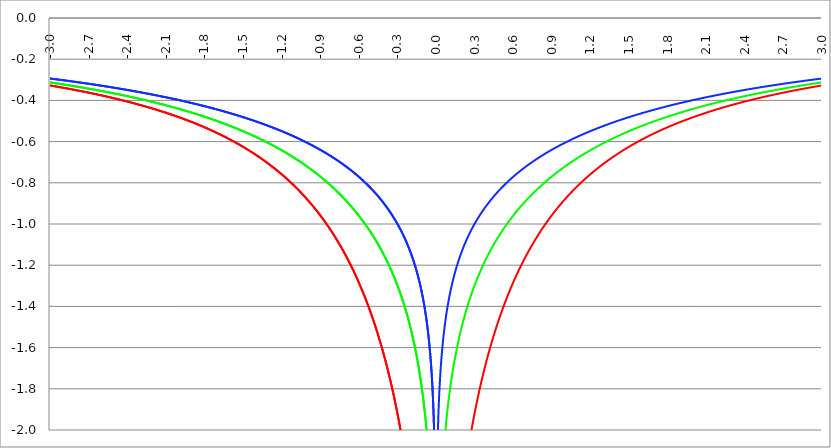
| Category | Series 1 | Series 0 | Series 2 |
|---|---|---|---|
| -3.0 | -0.327 | -0.313 | -0.294 |
| -2.997 | -0.328 | -0.313 | -0.294 |
| -2.994 | -0.328 | -0.313 | -0.294 |
| -2.991 | -0.328 | -0.313 | -0.294 |
| -2.988 | -0.329 | -0.314 | -0.295 |
| -2.984999999999999 | -0.329 | -0.314 | -0.295 |
| -2.981999999999999 | -0.329 | -0.314 | -0.295 |
| -2.978999999999999 | -0.33 | -0.315 | -0.295 |
| -2.975999999999999 | -0.33 | -0.315 | -0.296 |
| -2.972999999999999 | -0.33 | -0.315 | -0.296 |
| -2.969999999999999 | -0.331 | -0.315 | -0.296 |
| -2.966999999999999 | -0.331 | -0.316 | -0.296 |
| -2.963999999999999 | -0.331 | -0.316 | -0.297 |
| -2.960999999999998 | -0.332 | -0.316 | -0.297 |
| -2.957999999999998 | -0.332 | -0.317 | -0.297 |
| -2.954999999999998 | -0.332 | -0.317 | -0.297 |
| -2.951999999999998 | -0.333 | -0.317 | -0.298 |
| -2.948999999999998 | -0.333 | -0.317 | -0.298 |
| -2.945999999999998 | -0.333 | -0.318 | -0.298 |
| -2.942999999999998 | -0.334 | -0.318 | -0.298 |
| -2.939999999999998 | -0.334 | -0.318 | -0.299 |
| -2.936999999999998 | -0.334 | -0.319 | -0.299 |
| -2.933999999999997 | -0.335 | -0.319 | -0.299 |
| -2.930999999999997 | -0.335 | -0.319 | -0.299 |
| -2.927999999999997 | -0.335 | -0.319 | -0.3 |
| -2.924999999999997 | -0.336 | -0.32 | -0.3 |
| -2.921999999999997 | -0.336 | -0.32 | -0.3 |
| -2.918999999999997 | -0.336 | -0.32 | -0.3 |
| -2.915999999999997 | -0.337 | -0.321 | -0.301 |
| -2.912999999999997 | -0.337 | -0.321 | -0.301 |
| -2.909999999999997 | -0.337 | -0.321 | -0.301 |
| -2.906999999999996 | -0.338 | -0.321 | -0.301 |
| -2.903999999999996 | -0.338 | -0.322 | -0.302 |
| -2.900999999999996 | -0.338 | -0.322 | -0.302 |
| -2.897999999999996 | -0.339 | -0.322 | -0.302 |
| -2.894999999999996 | -0.339 | -0.323 | -0.302 |
| -2.891999999999996 | -0.339 | -0.323 | -0.303 |
| -2.888999999999996 | -0.34 | -0.323 | -0.303 |
| -2.885999999999996 | -0.34 | -0.323 | -0.303 |
| -2.882999999999996 | -0.34 | -0.324 | -0.303 |
| -2.879999999999995 | -0.341 | -0.324 | -0.304 |
| -2.876999999999995 | -0.341 | -0.324 | -0.304 |
| -2.873999999999995 | -0.341 | -0.325 | -0.304 |
| -2.870999999999995 | -0.342 | -0.325 | -0.304 |
| -2.867999999999995 | -0.342 | -0.325 | -0.305 |
| -2.864999999999995 | -0.342 | -0.326 | -0.305 |
| -2.861999999999995 | -0.343 | -0.326 | -0.305 |
| -2.858999999999995 | -0.343 | -0.326 | -0.305 |
| -2.855999999999994 | -0.343 | -0.326 | -0.306 |
| -2.852999999999994 | -0.344 | -0.327 | -0.306 |
| -2.849999999999994 | -0.344 | -0.327 | -0.306 |
| -2.846999999999994 | -0.344 | -0.327 | -0.306 |
| -2.843999999999994 | -0.345 | -0.328 | -0.307 |
| -2.840999999999994 | -0.345 | -0.328 | -0.307 |
| -2.837999999999994 | -0.345 | -0.328 | -0.307 |
| -2.834999999999994 | -0.346 | -0.329 | -0.307 |
| -2.831999999999994 | -0.346 | -0.329 | -0.308 |
| -2.828999999999993 | -0.347 | -0.329 | -0.308 |
| -2.825999999999993 | -0.347 | -0.329 | -0.308 |
| -2.822999999999993 | -0.347 | -0.33 | -0.308 |
| -2.819999999999993 | -0.348 | -0.33 | -0.309 |
| -2.816999999999993 | -0.348 | -0.33 | -0.309 |
| -2.813999999999993 | -0.348 | -0.331 | -0.309 |
| -2.810999999999993 | -0.349 | -0.331 | -0.309 |
| -2.807999999999993 | -0.349 | -0.331 | -0.31 |
| -2.804999999999993 | -0.349 | -0.332 | -0.31 |
| -2.801999999999992 | -0.35 | -0.332 | -0.31 |
| -2.798999999999992 | -0.35 | -0.332 | -0.31 |
| -2.795999999999992 | -0.35 | -0.333 | -0.311 |
| -2.792999999999992 | -0.351 | -0.333 | -0.311 |
| -2.789999999999992 | -0.351 | -0.333 | -0.311 |
| -2.786999999999992 | -0.352 | -0.334 | -0.311 |
| -2.783999999999992 | -0.352 | -0.334 | -0.312 |
| -2.780999999999992 | -0.352 | -0.334 | -0.312 |
| -2.777999999999992 | -0.353 | -0.334 | -0.312 |
| -2.774999999999991 | -0.353 | -0.335 | -0.313 |
| -2.771999999999991 | -0.353 | -0.335 | -0.313 |
| -2.768999999999991 | -0.354 | -0.335 | -0.313 |
| -2.765999999999991 | -0.354 | -0.336 | -0.313 |
| -2.762999999999991 | -0.354 | -0.336 | -0.314 |
| -2.759999999999991 | -0.355 | -0.336 | -0.314 |
| -2.756999999999991 | -0.355 | -0.337 | -0.314 |
| -2.753999999999991 | -0.356 | -0.337 | -0.314 |
| -2.75099999999999 | -0.356 | -0.337 | -0.315 |
| -2.74799999999999 | -0.356 | -0.338 | -0.315 |
| -2.74499999999999 | -0.357 | -0.338 | -0.315 |
| -2.74199999999999 | -0.357 | -0.338 | -0.315 |
| -2.73899999999999 | -0.357 | -0.339 | -0.316 |
| -2.73599999999999 | -0.358 | -0.339 | -0.316 |
| -2.73299999999999 | -0.358 | -0.339 | -0.316 |
| -2.72999999999999 | -0.359 | -0.34 | -0.317 |
| -2.72699999999999 | -0.359 | -0.34 | -0.317 |
| -2.723999999999989 | -0.359 | -0.34 | -0.317 |
| -2.720999999999989 | -0.36 | -0.341 | -0.317 |
| -2.717999999999989 | -0.36 | -0.341 | -0.318 |
| -2.714999999999989 | -0.36 | -0.341 | -0.318 |
| -2.711999999999989 | -0.361 | -0.342 | -0.318 |
| -2.708999999999989 | -0.361 | -0.342 | -0.318 |
| -2.705999999999989 | -0.362 | -0.342 | -0.319 |
| -2.702999999999989 | -0.362 | -0.343 | -0.319 |
| -2.699999999999989 | -0.362 | -0.343 | -0.319 |
| -2.696999999999988 | -0.363 | -0.343 | -0.32 |
| -2.693999999999988 | -0.363 | -0.344 | -0.32 |
| -2.690999999999988 | -0.364 | -0.344 | -0.32 |
| -2.687999999999988 | -0.364 | -0.344 | -0.32 |
| -2.684999999999988 | -0.364 | -0.345 | -0.321 |
| -2.681999999999988 | -0.365 | -0.345 | -0.321 |
| -2.678999999999988 | -0.365 | -0.345 | -0.321 |
| -2.675999999999988 | -0.365 | -0.346 | -0.321 |
| -2.672999999999988 | -0.366 | -0.346 | -0.322 |
| -2.669999999999987 | -0.366 | -0.346 | -0.322 |
| -2.666999999999987 | -0.367 | -0.347 | -0.322 |
| -2.663999999999987 | -0.367 | -0.347 | -0.323 |
| -2.660999999999987 | -0.367 | -0.347 | -0.323 |
| -2.657999999999987 | -0.368 | -0.348 | -0.323 |
| -2.654999999999987 | -0.368 | -0.348 | -0.323 |
| -2.651999999999987 | -0.369 | -0.348 | -0.324 |
| -2.648999999999987 | -0.369 | -0.349 | -0.324 |
| -2.645999999999986 | -0.369 | -0.349 | -0.324 |
| -2.642999999999986 | -0.37 | -0.349 | -0.325 |
| -2.639999999999986 | -0.37 | -0.35 | -0.325 |
| -2.636999999999986 | -0.371 | -0.35 | -0.325 |
| -2.633999999999986 | -0.371 | -0.35 | -0.325 |
| -2.630999999999986 | -0.371 | -0.351 | -0.326 |
| -2.627999999999986 | -0.372 | -0.351 | -0.326 |
| -2.624999999999986 | -0.372 | -0.351 | -0.326 |
| -2.621999999999986 | -0.373 | -0.352 | -0.327 |
| -2.618999999999985 | -0.373 | -0.352 | -0.327 |
| -2.615999999999985 | -0.374 | -0.352 | -0.327 |
| -2.612999999999985 | -0.374 | -0.353 | -0.327 |
| -2.609999999999985 | -0.374 | -0.353 | -0.328 |
| -2.606999999999985 | -0.375 | -0.353 | -0.328 |
| -2.603999999999985 | -0.375 | -0.354 | -0.328 |
| -2.600999999999985 | -0.376 | -0.354 | -0.329 |
| -2.597999999999985 | -0.376 | -0.354 | -0.329 |
| -2.594999999999985 | -0.376 | -0.355 | -0.329 |
| -2.591999999999985 | -0.377 | -0.355 | -0.329 |
| -2.588999999999984 | -0.377 | -0.356 | -0.33 |
| -2.585999999999984 | -0.378 | -0.356 | -0.33 |
| -2.582999999999984 | -0.378 | -0.356 | -0.33 |
| -2.579999999999984 | -0.378 | -0.357 | -0.331 |
| -2.576999999999984 | -0.379 | -0.357 | -0.331 |
| -2.573999999999984 | -0.379 | -0.357 | -0.331 |
| -2.570999999999984 | -0.38 | -0.358 | -0.332 |
| -2.567999999999984 | -0.38 | -0.358 | -0.332 |
| -2.564999999999984 | -0.381 | -0.358 | -0.332 |
| -2.561999999999983 | -0.381 | -0.359 | -0.332 |
| -2.558999999999983 | -0.381 | -0.359 | -0.333 |
| -2.555999999999983 | -0.382 | -0.359 | -0.333 |
| -2.552999999999983 | -0.382 | -0.36 | -0.333 |
| -2.549999999999983 | -0.383 | -0.36 | -0.334 |
| -2.546999999999983 | -0.383 | -0.361 | -0.334 |
| -2.543999999999983 | -0.384 | -0.361 | -0.334 |
| -2.540999999999983 | -0.384 | -0.361 | -0.335 |
| -2.537999999999982 | -0.384 | -0.362 | -0.335 |
| -2.534999999999982 | -0.385 | -0.362 | -0.335 |
| -2.531999999999982 | -0.385 | -0.362 | -0.335 |
| -2.528999999999982 | -0.386 | -0.363 | -0.336 |
| -2.525999999999982 | -0.386 | -0.363 | -0.336 |
| -2.522999999999982 | -0.387 | -0.363 | -0.336 |
| -2.519999999999982 | -0.387 | -0.364 | -0.337 |
| -2.516999999999982 | -0.388 | -0.364 | -0.337 |
| -2.513999999999982 | -0.388 | -0.365 | -0.337 |
| -2.510999999999981 | -0.388 | -0.365 | -0.338 |
| -2.507999999999981 | -0.389 | -0.365 | -0.338 |
| -2.504999999999981 | -0.389 | -0.366 | -0.338 |
| -2.501999999999981 | -0.39 | -0.366 | -0.338 |
| -2.498999999999981 | -0.39 | -0.366 | -0.339 |
| -2.495999999999981 | -0.391 | -0.367 | -0.339 |
| -2.492999999999981 | -0.391 | -0.367 | -0.339 |
| -2.489999999999981 | -0.392 | -0.368 | -0.34 |
| -2.486999999999981 | -0.392 | -0.368 | -0.34 |
| -2.48399999999998 | -0.392 | -0.368 | -0.34 |
| -2.48099999999998 | -0.393 | -0.369 | -0.341 |
| -2.47799999999998 | -0.393 | -0.369 | -0.341 |
| -2.47499999999998 | -0.394 | -0.369 | -0.341 |
| -2.47199999999998 | -0.394 | -0.37 | -0.342 |
| -2.46899999999998 | -0.395 | -0.37 | -0.342 |
| -2.46599999999998 | -0.395 | -0.371 | -0.342 |
| -2.46299999999998 | -0.396 | -0.371 | -0.342 |
| -2.45999999999998 | -0.396 | -0.371 | -0.343 |
| -2.456999999999979 | -0.397 | -0.372 | -0.343 |
| -2.453999999999979 | -0.397 | -0.372 | -0.343 |
| -2.450999999999979 | -0.397 | -0.373 | -0.344 |
| -2.44799999999998 | -0.398 | -0.373 | -0.344 |
| -2.444999999999979 | -0.398 | -0.373 | -0.344 |
| -2.441999999999979 | -0.399 | -0.374 | -0.345 |
| -2.438999999999979 | -0.399 | -0.374 | -0.345 |
| -2.435999999999979 | -0.4 | -0.374 | -0.345 |
| -2.432999999999978 | -0.4 | -0.375 | -0.346 |
| -2.429999999999978 | -0.401 | -0.375 | -0.346 |
| -2.426999999999978 | -0.401 | -0.376 | -0.346 |
| -2.423999999999978 | -0.402 | -0.376 | -0.347 |
| -2.420999999999978 | -0.402 | -0.376 | -0.347 |
| -2.417999999999978 | -0.403 | -0.377 | -0.347 |
| -2.414999999999978 | -0.403 | -0.377 | -0.348 |
| -2.411999999999978 | -0.404 | -0.378 | -0.348 |
| -2.408999999999978 | -0.404 | -0.378 | -0.348 |
| -2.405999999999977 | -0.405 | -0.378 | -0.349 |
| -2.402999999999977 | -0.405 | -0.379 | -0.349 |
| -2.399999999999977 | -0.405 | -0.379 | -0.349 |
| -2.396999999999977 | -0.406 | -0.38 | -0.35 |
| -2.393999999999977 | -0.406 | -0.38 | -0.35 |
| -2.390999999999977 | -0.407 | -0.38 | -0.35 |
| -2.387999999999977 | -0.407 | -0.381 | -0.351 |
| -2.384999999999977 | -0.408 | -0.381 | -0.351 |
| -2.381999999999977 | -0.408 | -0.382 | -0.351 |
| -2.378999999999976 | -0.409 | -0.382 | -0.351 |
| -2.375999999999976 | -0.409 | -0.382 | -0.352 |
| -2.372999999999976 | -0.41 | -0.383 | -0.352 |
| -2.369999999999976 | -0.41 | -0.383 | -0.352 |
| -2.366999999999976 | -0.411 | -0.384 | -0.353 |
| -2.363999999999976 | -0.411 | -0.384 | -0.353 |
| -2.360999999999976 | -0.412 | -0.385 | -0.353 |
| -2.357999999999976 | -0.412 | -0.385 | -0.354 |
| -2.354999999999976 | -0.413 | -0.385 | -0.354 |
| -2.351999999999975 | -0.413 | -0.386 | -0.354 |
| -2.348999999999975 | -0.414 | -0.386 | -0.355 |
| -2.345999999999975 | -0.414 | -0.387 | -0.355 |
| -2.342999999999975 | -0.415 | -0.387 | -0.355 |
| -2.339999999999975 | -0.415 | -0.387 | -0.356 |
| -2.336999999999975 | -0.416 | -0.388 | -0.356 |
| -2.333999999999975 | -0.416 | -0.388 | -0.356 |
| -2.330999999999975 | -0.417 | -0.389 | -0.357 |
| -2.327999999999974 | -0.417 | -0.389 | -0.357 |
| -2.324999999999974 | -0.418 | -0.39 | -0.358 |
| -2.321999999999974 | -0.418 | -0.39 | -0.358 |
| -2.318999999999974 | -0.419 | -0.39 | -0.358 |
| -2.315999999999974 | -0.419 | -0.391 | -0.359 |
| -2.312999999999974 | -0.42 | -0.391 | -0.359 |
| -2.309999999999974 | -0.42 | -0.392 | -0.359 |
| -2.306999999999974 | -0.421 | -0.392 | -0.36 |
| -2.303999999999974 | -0.421 | -0.392 | -0.36 |
| -2.300999999999973 | -0.422 | -0.393 | -0.36 |
| -2.297999999999973 | -0.422 | -0.393 | -0.361 |
| -2.294999999999973 | -0.423 | -0.394 | -0.361 |
| -2.291999999999973 | -0.424 | -0.394 | -0.361 |
| -2.288999999999973 | -0.424 | -0.395 | -0.362 |
| -2.285999999999973 | -0.425 | -0.395 | -0.362 |
| -2.282999999999973 | -0.425 | -0.395 | -0.362 |
| -2.279999999999973 | -0.426 | -0.396 | -0.363 |
| -2.276999999999973 | -0.426 | -0.396 | -0.363 |
| -2.273999999999972 | -0.427 | -0.397 | -0.363 |
| -2.270999999999972 | -0.427 | -0.397 | -0.364 |
| -2.267999999999972 | -0.428 | -0.398 | -0.364 |
| -2.264999999999972 | -0.428 | -0.398 | -0.364 |
| -2.261999999999972 | -0.429 | -0.399 | -0.365 |
| -2.258999999999972 | -0.429 | -0.399 | -0.365 |
| -2.255999999999972 | -0.43 | -0.399 | -0.365 |
| -2.252999999999972 | -0.43 | -0.4 | -0.366 |
| -2.249999999999972 | -0.431 | -0.4 | -0.366 |
| -2.246999999999971 | -0.432 | -0.401 | -0.367 |
| -2.243999999999971 | -0.432 | -0.401 | -0.367 |
| -2.240999999999971 | -0.433 | -0.402 | -0.367 |
| -2.237999999999971 | -0.433 | -0.402 | -0.368 |
| -2.234999999999971 | -0.434 | -0.403 | -0.368 |
| -2.231999999999971 | -0.434 | -0.403 | -0.368 |
| -2.228999999999971 | -0.435 | -0.403 | -0.369 |
| -2.225999999999971 | -0.435 | -0.404 | -0.369 |
| -2.222999999999971 | -0.436 | -0.404 | -0.369 |
| -2.21999999999997 | -0.436 | -0.405 | -0.37 |
| -2.21699999999997 | -0.437 | -0.405 | -0.37 |
| -2.21399999999997 | -0.438 | -0.406 | -0.371 |
| -2.21099999999997 | -0.438 | -0.406 | -0.371 |
| -2.20799999999997 | -0.439 | -0.407 | -0.371 |
| -2.20499999999997 | -0.439 | -0.407 | -0.372 |
| -2.20199999999997 | -0.44 | -0.407 | -0.372 |
| -2.19899999999997 | -0.44 | -0.408 | -0.372 |
| -2.19599999999997 | -0.441 | -0.408 | -0.373 |
| -2.192999999999969 | -0.442 | -0.409 | -0.373 |
| -2.189999999999969 | -0.442 | -0.409 | -0.373 |
| -2.186999999999969 | -0.443 | -0.41 | -0.374 |
| -2.18399999999997 | -0.443 | -0.41 | -0.374 |
| -2.180999999999969 | -0.444 | -0.411 | -0.375 |
| -2.177999999999969 | -0.444 | -0.411 | -0.375 |
| -2.174999999999969 | -0.445 | -0.412 | -0.375 |
| -2.171999999999969 | -0.446 | -0.412 | -0.376 |
| -2.168999999999968 | -0.446 | -0.413 | -0.376 |
| -2.165999999999968 | -0.447 | -0.413 | -0.376 |
| -2.162999999999968 | -0.447 | -0.414 | -0.377 |
| -2.159999999999968 | -0.448 | -0.414 | -0.377 |
| -2.156999999999968 | -0.448 | -0.414 | -0.378 |
| -2.153999999999968 | -0.449 | -0.415 | -0.378 |
| -2.150999999999968 | -0.45 | -0.415 | -0.378 |
| -2.147999999999968 | -0.45 | -0.416 | -0.379 |
| -2.144999999999968 | -0.451 | -0.416 | -0.379 |
| -2.141999999999967 | -0.451 | -0.417 | -0.379 |
| -2.138999999999967 | -0.452 | -0.417 | -0.38 |
| -2.135999999999967 | -0.453 | -0.418 | -0.38 |
| -2.132999999999967 | -0.453 | -0.418 | -0.381 |
| -2.129999999999967 | -0.454 | -0.419 | -0.381 |
| -2.126999999999967 | -0.454 | -0.419 | -0.381 |
| -2.123999999999967 | -0.455 | -0.42 | -0.382 |
| -2.120999999999967 | -0.456 | -0.42 | -0.382 |
| -2.117999999999967 | -0.456 | -0.421 | -0.382 |
| -2.114999999999966 | -0.457 | -0.421 | -0.383 |
| -2.111999999999966 | -0.457 | -0.422 | -0.383 |
| -2.108999999999966 | -0.458 | -0.422 | -0.384 |
| -2.105999999999966 | -0.459 | -0.423 | -0.384 |
| -2.102999999999966 | -0.459 | -0.423 | -0.384 |
| -2.099999999999966 | -0.46 | -0.424 | -0.385 |
| -2.096999999999966 | -0.46 | -0.424 | -0.385 |
| -2.093999999999966 | -0.461 | -0.425 | -0.386 |
| -2.090999999999966 | -0.462 | -0.425 | -0.386 |
| -2.087999999999965 | -0.462 | -0.426 | -0.386 |
| -2.084999999999965 | -0.463 | -0.426 | -0.387 |
| -2.081999999999965 | -0.464 | -0.427 | -0.387 |
| -2.078999999999965 | -0.464 | -0.427 | -0.388 |
| -2.075999999999965 | -0.465 | -0.428 | -0.388 |
| -2.072999999999965 | -0.465 | -0.428 | -0.388 |
| -2.069999999999965 | -0.466 | -0.429 | -0.389 |
| -2.066999999999965 | -0.467 | -0.429 | -0.389 |
| -2.063999999999965 | -0.467 | -0.43 | -0.39 |
| -2.060999999999964 | -0.468 | -0.43 | -0.39 |
| -2.057999999999964 | -0.469 | -0.431 | -0.39 |
| -2.054999999999964 | -0.469 | -0.431 | -0.391 |
| -2.051999999999964 | -0.47 | -0.432 | -0.391 |
| -2.048999999999964 | -0.47 | -0.432 | -0.392 |
| -2.045999999999964 | -0.471 | -0.433 | -0.392 |
| -2.042999999999964 | -0.472 | -0.433 | -0.392 |
| -2.039999999999964 | -0.472 | -0.434 | -0.393 |
| -2.036999999999963 | -0.473 | -0.434 | -0.393 |
| -2.033999999999963 | -0.474 | -0.435 | -0.394 |
| -2.030999999999963 | -0.474 | -0.435 | -0.394 |
| -2.027999999999963 | -0.475 | -0.436 | -0.394 |
| -2.024999999999963 | -0.476 | -0.436 | -0.395 |
| -2.021999999999963 | -0.476 | -0.437 | -0.395 |
| -2.018999999999963 | -0.477 | -0.437 | -0.396 |
| -2.015999999999963 | -0.478 | -0.438 | -0.396 |
| -2.012999999999963 | -0.478 | -0.438 | -0.396 |
| -2.009999999999962 | -0.479 | -0.439 | -0.397 |
| -2.006999999999962 | -0.48 | -0.439 | -0.397 |
| -2.003999999999962 | -0.48 | -0.44 | -0.398 |
| -2.000999999999962 | -0.481 | -0.441 | -0.398 |
| -1.997999999999962 | -0.482 | -0.441 | -0.399 |
| -1.994999999999962 | -0.482 | -0.442 | -0.399 |
| -1.991999999999962 | -0.483 | -0.442 | -0.399 |
| -1.988999999999963 | -0.484 | -0.443 | -0.4 |
| -1.985999999999963 | -0.484 | -0.443 | -0.4 |
| -1.982999999999963 | -0.485 | -0.444 | -0.401 |
| -1.979999999999963 | -0.486 | -0.444 | -0.401 |
| -1.976999999999963 | -0.486 | -0.445 | -0.401 |
| -1.973999999999963 | -0.487 | -0.445 | -0.402 |
| -1.970999999999963 | -0.488 | -0.446 | -0.402 |
| -1.967999999999963 | -0.488 | -0.446 | -0.403 |
| -1.964999999999963 | -0.489 | -0.447 | -0.403 |
| -1.961999999999964 | -0.49 | -0.448 | -0.404 |
| -1.958999999999964 | -0.491 | -0.448 | -0.404 |
| -1.955999999999964 | -0.491 | -0.449 | -0.404 |
| -1.952999999999964 | -0.492 | -0.449 | -0.405 |
| -1.949999999999964 | -0.493 | -0.45 | -0.405 |
| -1.946999999999964 | -0.493 | -0.45 | -0.406 |
| -1.943999999999964 | -0.494 | -0.451 | -0.406 |
| -1.940999999999964 | -0.495 | -0.451 | -0.407 |
| -1.937999999999964 | -0.495 | -0.452 | -0.407 |
| -1.934999999999964 | -0.496 | -0.452 | -0.407 |
| -1.931999999999965 | -0.497 | -0.453 | -0.408 |
| -1.928999999999965 | -0.498 | -0.454 | -0.408 |
| -1.925999999999965 | -0.498 | -0.454 | -0.409 |
| -1.922999999999965 | -0.499 | -0.455 | -0.409 |
| -1.919999999999965 | -0.5 | -0.455 | -0.41 |
| -1.916999999999965 | -0.5 | -0.456 | -0.41 |
| -1.913999999999965 | -0.501 | -0.456 | -0.411 |
| -1.910999999999965 | -0.502 | -0.457 | -0.411 |
| -1.907999999999965 | -0.503 | -0.458 | -0.411 |
| -1.904999999999966 | -0.503 | -0.458 | -0.412 |
| -1.901999999999966 | -0.504 | -0.459 | -0.412 |
| -1.898999999999966 | -0.505 | -0.459 | -0.413 |
| -1.895999999999966 | -0.506 | -0.46 | -0.413 |
| -1.892999999999966 | -0.506 | -0.46 | -0.414 |
| -1.889999999999966 | -0.507 | -0.461 | -0.414 |
| -1.886999999999966 | -0.508 | -0.462 | -0.415 |
| -1.883999999999966 | -0.509 | -0.462 | -0.415 |
| -1.880999999999966 | -0.509 | -0.463 | -0.415 |
| -1.877999999999967 | -0.51 | -0.463 | -0.416 |
| -1.874999999999967 | -0.511 | -0.464 | -0.416 |
| -1.871999999999967 | -0.512 | -0.464 | -0.417 |
| -1.868999999999967 | -0.512 | -0.465 | -0.417 |
| -1.865999999999967 | -0.513 | -0.466 | -0.418 |
| -1.862999999999967 | -0.514 | -0.466 | -0.418 |
| -1.859999999999967 | -0.515 | -0.467 | -0.419 |
| -1.856999999999967 | -0.515 | -0.467 | -0.419 |
| -1.853999999999967 | -0.516 | -0.468 | -0.42 |
| -1.850999999999968 | -0.517 | -0.469 | -0.42 |
| -1.847999999999968 | -0.518 | -0.469 | -0.42 |
| -1.844999999999968 | -0.518 | -0.47 | -0.421 |
| -1.841999999999968 | -0.519 | -0.47 | -0.421 |
| -1.838999999999968 | -0.52 | -0.471 | -0.422 |
| -1.835999999999968 | -0.521 | -0.472 | -0.422 |
| -1.832999999999968 | -0.522 | -0.472 | -0.423 |
| -1.829999999999968 | -0.522 | -0.473 | -0.423 |
| -1.826999999999968 | -0.523 | -0.473 | -0.424 |
| -1.823999999999968 | -0.524 | -0.474 | -0.424 |
| -1.820999999999969 | -0.525 | -0.475 | -0.425 |
| -1.817999999999969 | -0.526 | -0.475 | -0.425 |
| -1.814999999999969 | -0.526 | -0.476 | -0.426 |
| -1.811999999999969 | -0.527 | -0.476 | -0.426 |
| -1.808999999999969 | -0.528 | -0.477 | -0.427 |
| -1.805999999999969 | -0.529 | -0.478 | -0.427 |
| -1.802999999999969 | -0.53 | -0.478 | -0.427 |
| -1.799999999999969 | -0.53 | -0.479 | -0.428 |
| -1.796999999999969 | -0.531 | -0.48 | -0.428 |
| -1.79399999999997 | -0.532 | -0.48 | -0.429 |
| -1.79099999999997 | -0.533 | -0.481 | -0.429 |
| -1.78799999999997 | -0.534 | -0.481 | -0.43 |
| -1.78499999999997 | -0.534 | -0.482 | -0.43 |
| -1.78199999999997 | -0.535 | -0.483 | -0.431 |
| -1.77899999999997 | -0.536 | -0.483 | -0.431 |
| -1.77599999999997 | -0.537 | -0.484 | -0.432 |
| -1.77299999999997 | -0.538 | -0.485 | -0.432 |
| -1.76999999999997 | -0.539 | -0.485 | -0.433 |
| -1.766999999999971 | -0.539 | -0.486 | -0.433 |
| -1.763999999999971 | -0.54 | -0.486 | -0.434 |
| -1.760999999999971 | -0.541 | -0.487 | -0.434 |
| -1.757999999999971 | -0.542 | -0.488 | -0.435 |
| -1.754999999999971 | -0.543 | -0.488 | -0.435 |
| -1.751999999999971 | -0.544 | -0.489 | -0.436 |
| -1.748999999999971 | -0.544 | -0.49 | -0.436 |
| -1.745999999999971 | -0.545 | -0.49 | -0.437 |
| -1.742999999999971 | -0.546 | -0.491 | -0.437 |
| -1.739999999999971 | -0.547 | -0.492 | -0.438 |
| -1.736999999999972 | -0.548 | -0.492 | -0.438 |
| -1.733999999999972 | -0.549 | -0.493 | -0.439 |
| -1.730999999999972 | -0.55 | -0.494 | -0.439 |
| -1.727999999999972 | -0.55 | -0.494 | -0.44 |
| -1.724999999999972 | -0.551 | -0.495 | -0.44 |
| -1.721999999999972 | -0.552 | -0.496 | -0.441 |
| -1.718999999999972 | -0.553 | -0.496 | -0.441 |
| -1.715999999999972 | -0.554 | -0.497 | -0.442 |
| -1.712999999999972 | -0.555 | -0.498 | -0.442 |
| -1.709999999999973 | -0.556 | -0.498 | -0.443 |
| -1.706999999999973 | -0.557 | -0.499 | -0.443 |
| -1.703999999999973 | -0.558 | -0.5 | -0.444 |
| -1.700999999999973 | -0.558 | -0.5 | -0.444 |
| -1.697999999999973 | -0.559 | -0.501 | -0.445 |
| -1.694999999999973 | -0.56 | -0.502 | -0.445 |
| -1.691999999999973 | -0.561 | -0.502 | -0.446 |
| -1.688999999999973 | -0.562 | -0.503 | -0.446 |
| -1.685999999999973 | -0.563 | -0.504 | -0.447 |
| -1.682999999999974 | -0.564 | -0.504 | -0.447 |
| -1.679999999999974 | -0.565 | -0.505 | -0.448 |
| -1.676999999999974 | -0.566 | -0.506 | -0.448 |
| -1.673999999999974 | -0.567 | -0.506 | -0.449 |
| -1.670999999999974 | -0.567 | -0.507 | -0.449 |
| -1.667999999999974 | -0.568 | -0.508 | -0.45 |
| -1.664999999999974 | -0.569 | -0.508 | -0.45 |
| -1.661999999999974 | -0.57 | -0.509 | -0.451 |
| -1.658999999999974 | -0.571 | -0.51 | -0.451 |
| -1.655999999999975 | -0.572 | -0.51 | -0.452 |
| -1.652999999999975 | -0.573 | -0.511 | -0.453 |
| -1.649999999999975 | -0.574 | -0.512 | -0.453 |
| -1.646999999999975 | -0.575 | -0.513 | -0.454 |
| -1.643999999999975 | -0.576 | -0.513 | -0.454 |
| -1.640999999999975 | -0.577 | -0.514 | -0.455 |
| -1.637999999999975 | -0.578 | -0.515 | -0.455 |
| -1.634999999999975 | -0.579 | -0.515 | -0.456 |
| -1.631999999999975 | -0.58 | -0.516 | -0.456 |
| -1.628999999999975 | -0.581 | -0.517 | -0.457 |
| -1.625999999999976 | -0.582 | -0.518 | -0.457 |
| -1.622999999999976 | -0.583 | -0.518 | -0.458 |
| -1.619999999999976 | -0.584 | -0.519 | -0.458 |
| -1.616999999999976 | -0.585 | -0.52 | -0.459 |
| -1.613999999999976 | -0.586 | -0.52 | -0.46 |
| -1.610999999999976 | -0.587 | -0.521 | -0.46 |
| -1.607999999999976 | -0.588 | -0.522 | -0.461 |
| -1.604999999999976 | -0.588 | -0.523 | -0.461 |
| -1.601999999999976 | -0.589 | -0.523 | -0.462 |
| -1.598999999999977 | -0.59 | -0.524 | -0.462 |
| -1.595999999999977 | -0.591 | -0.525 | -0.463 |
| -1.592999999999977 | -0.592 | -0.526 | -0.463 |
| -1.589999999999977 | -0.593 | -0.526 | -0.464 |
| -1.586999999999977 | -0.594 | -0.527 | -0.464 |
| -1.583999999999977 | -0.595 | -0.528 | -0.465 |
| -1.580999999999977 | -0.597 | -0.528 | -0.466 |
| -1.577999999999977 | -0.598 | -0.529 | -0.466 |
| -1.574999999999978 | -0.599 | -0.53 | -0.467 |
| -1.571999999999978 | -0.6 | -0.531 | -0.467 |
| -1.568999999999978 | -0.601 | -0.531 | -0.468 |
| -1.565999999999978 | -0.602 | -0.532 | -0.468 |
| -1.562999999999978 | -0.603 | -0.533 | -0.469 |
| -1.559999999999978 | -0.604 | -0.534 | -0.47 |
| -1.556999999999978 | -0.605 | -0.534 | -0.47 |
| -1.553999999999978 | -0.606 | -0.535 | -0.471 |
| -1.550999999999978 | -0.607 | -0.536 | -0.471 |
| -1.547999999999978 | -0.608 | -0.537 | -0.472 |
| -1.544999999999979 | -0.609 | -0.538 | -0.472 |
| -1.541999999999979 | -0.61 | -0.538 | -0.473 |
| -1.538999999999979 | -0.611 | -0.539 | -0.474 |
| -1.535999999999979 | -0.612 | -0.54 | -0.474 |
| -1.532999999999979 | -0.613 | -0.541 | -0.475 |
| -1.529999999999979 | -0.614 | -0.541 | -0.475 |
| -1.526999999999979 | -0.615 | -0.542 | -0.476 |
| -1.523999999999979 | -0.616 | -0.543 | -0.476 |
| -1.520999999999979 | -0.617 | -0.544 | -0.477 |
| -1.51799999999998 | -0.619 | -0.545 | -0.478 |
| -1.51499999999998 | -0.62 | -0.545 | -0.478 |
| -1.51199999999998 | -0.621 | -0.546 | -0.479 |
| -1.50899999999998 | -0.622 | -0.547 | -0.479 |
| -1.50599999999998 | -0.623 | -0.548 | -0.48 |
| -1.50299999999998 | -0.624 | -0.549 | -0.481 |
| -1.49999999999998 | -0.625 | -0.549 | -0.481 |
| -1.49699999999998 | -0.626 | -0.55 | -0.482 |
| -1.49399999999998 | -0.627 | -0.551 | -0.482 |
| -1.490999999999981 | -0.628 | -0.552 | -0.483 |
| -1.487999999999981 | -0.63 | -0.553 | -0.484 |
| -1.484999999999981 | -0.631 | -0.553 | -0.484 |
| -1.481999999999981 | -0.632 | -0.554 | -0.485 |
| -1.478999999999981 | -0.633 | -0.555 | -0.485 |
| -1.475999999999981 | -0.634 | -0.556 | -0.486 |
| -1.472999999999981 | -0.635 | -0.557 | -0.487 |
| -1.469999999999981 | -0.636 | -0.557 | -0.487 |
| -1.466999999999981 | -0.638 | -0.558 | -0.488 |
| -1.463999999999982 | -0.639 | -0.559 | -0.488 |
| -1.460999999999982 | -0.64 | -0.56 | -0.489 |
| -1.457999999999982 | -0.641 | -0.561 | -0.49 |
| -1.454999999999982 | -0.642 | -0.562 | -0.49 |
| -1.451999999999982 | -0.643 | -0.562 | -0.491 |
| -1.448999999999982 | -0.645 | -0.563 | -0.492 |
| -1.445999999999982 | -0.646 | -0.564 | -0.492 |
| -1.442999999999982 | -0.647 | -0.565 | -0.493 |
| -1.439999999999982 | -0.648 | -0.566 | -0.493 |
| -1.436999999999982 | -0.649 | -0.567 | -0.494 |
| -1.433999999999983 | -0.65 | -0.567 | -0.495 |
| -1.430999999999983 | -0.652 | -0.568 | -0.495 |
| -1.427999999999983 | -0.653 | -0.569 | -0.496 |
| -1.424999999999983 | -0.654 | -0.57 | -0.497 |
| -1.421999999999983 | -0.655 | -0.571 | -0.497 |
| -1.418999999999983 | -0.657 | -0.572 | -0.498 |
| -1.415999999999983 | -0.658 | -0.573 | -0.498 |
| -1.412999999999983 | -0.659 | -0.573 | -0.499 |
| -1.409999999999983 | -0.66 | -0.574 | -0.5 |
| -1.406999999999984 | -0.661 | -0.575 | -0.5 |
| -1.403999999999984 | -0.663 | -0.576 | -0.501 |
| -1.400999999999984 | -0.664 | -0.577 | -0.502 |
| -1.397999999999984 | -0.665 | -0.578 | -0.502 |
| -1.394999999999984 | -0.666 | -0.579 | -0.503 |
| -1.391999999999984 | -0.668 | -0.58 | -0.504 |
| -1.388999999999984 | -0.669 | -0.58 | -0.504 |
| -1.385999999999984 | -0.67 | -0.581 | -0.505 |
| -1.382999999999984 | -0.671 | -0.582 | -0.506 |
| -1.379999999999985 | -0.673 | -0.583 | -0.506 |
| -1.376999999999985 | -0.674 | -0.584 | -0.507 |
| -1.373999999999985 | -0.675 | -0.585 | -0.508 |
| -1.370999999999985 | -0.677 | -0.586 | -0.508 |
| -1.367999999999985 | -0.678 | -0.587 | -0.509 |
| -1.364999999999985 | -0.679 | -0.588 | -0.51 |
| -1.361999999999985 | -0.68 | -0.589 | -0.51 |
| -1.358999999999985 | -0.682 | -0.589 | -0.511 |
| -1.355999999999985 | -0.683 | -0.59 | -0.512 |
| -1.352999999999985 | -0.684 | -0.591 | -0.512 |
| -1.349999999999986 | -0.686 | -0.592 | -0.513 |
| -1.346999999999986 | -0.687 | -0.593 | -0.514 |
| -1.343999999999986 | -0.688 | -0.594 | -0.514 |
| -1.340999999999986 | -0.69 | -0.595 | -0.515 |
| -1.337999999999986 | -0.691 | -0.596 | -0.516 |
| -1.334999999999986 | -0.692 | -0.597 | -0.516 |
| -1.331999999999986 | -0.694 | -0.598 | -0.517 |
| -1.328999999999986 | -0.695 | -0.599 | -0.518 |
| -1.325999999999986 | -0.696 | -0.6 | -0.518 |
| -1.322999999999987 | -0.698 | -0.601 | -0.519 |
| -1.319999999999987 | -0.699 | -0.602 | -0.52 |
| -1.316999999999987 | -0.701 | -0.603 | -0.52 |
| -1.313999999999987 | -0.702 | -0.603 | -0.521 |
| -1.310999999999987 | -0.703 | -0.604 | -0.522 |
| -1.307999999999987 | -0.705 | -0.605 | -0.523 |
| -1.304999999999987 | -0.706 | -0.606 | -0.523 |
| -1.301999999999987 | -0.708 | -0.607 | -0.524 |
| -1.298999999999987 | -0.709 | -0.608 | -0.525 |
| -1.295999999999988 | -0.71 | -0.609 | -0.525 |
| -1.292999999999988 | -0.712 | -0.61 | -0.526 |
| -1.289999999999988 | -0.713 | -0.611 | -0.527 |
| -1.286999999999988 | -0.715 | -0.612 | -0.528 |
| -1.283999999999988 | -0.716 | -0.613 | -0.528 |
| -1.280999999999988 | -0.717 | -0.614 | -0.529 |
| -1.277999999999988 | -0.719 | -0.615 | -0.53 |
| -1.274999999999988 | -0.72 | -0.616 | -0.53 |
| -1.271999999999988 | -0.722 | -0.617 | -0.531 |
| -1.268999999999989 | -0.723 | -0.618 | -0.532 |
| -1.265999999999989 | -0.725 | -0.619 | -0.533 |
| -1.262999999999989 | -0.726 | -0.62 | -0.533 |
| -1.259999999999989 | -0.728 | -0.621 | -0.534 |
| -1.256999999999989 | -0.729 | -0.622 | -0.535 |
| -1.253999999999989 | -0.731 | -0.623 | -0.535 |
| -1.250999999999989 | -0.732 | -0.624 | -0.536 |
| -1.247999999999989 | -0.734 | -0.625 | -0.537 |
| -1.244999999999989 | -0.735 | -0.626 | -0.538 |
| -1.24199999999999 | -0.737 | -0.627 | -0.538 |
| -1.23899999999999 | -0.738 | -0.628 | -0.539 |
| -1.23599999999999 | -0.74 | -0.629 | -0.54 |
| -1.23299999999999 | -0.741 | -0.63 | -0.541 |
| -1.22999999999999 | -0.743 | -0.631 | -0.541 |
| -1.22699999999999 | -0.744 | -0.632 | -0.542 |
| -1.22399999999999 | -0.746 | -0.633 | -0.543 |
| -1.22099999999999 | -0.747 | -0.634 | -0.544 |
| -1.21799999999999 | -0.749 | -0.636 | -0.544 |
| -1.214999999999991 | -0.751 | -0.637 | -0.545 |
| -1.211999999999991 | -0.752 | -0.638 | -0.546 |
| -1.208999999999991 | -0.754 | -0.639 | -0.547 |
| -1.205999999999991 | -0.755 | -0.64 | -0.548 |
| -1.202999999999991 | -0.757 | -0.641 | -0.548 |
| -1.199999999999991 | -0.758 | -0.642 | -0.549 |
| -1.196999999999991 | -0.76 | -0.643 | -0.55 |
| -1.193999999999991 | -0.762 | -0.644 | -0.551 |
| -1.190999999999991 | -0.763 | -0.645 | -0.551 |
| -1.187999999999991 | -0.765 | -0.646 | -0.552 |
| -1.184999999999992 | -0.767 | -0.647 | -0.553 |
| -1.181999999999992 | -0.768 | -0.648 | -0.554 |
| -1.178999999999992 | -0.77 | -0.649 | -0.555 |
| -1.175999999999992 | -0.771 | -0.651 | -0.555 |
| -1.172999999999992 | -0.773 | -0.652 | -0.556 |
| -1.169999999999992 | -0.775 | -0.653 | -0.557 |
| -1.166999999999992 | -0.776 | -0.654 | -0.558 |
| -1.163999999999992 | -0.778 | -0.655 | -0.559 |
| -1.160999999999992 | -0.78 | -0.656 | -0.559 |
| -1.157999999999993 | -0.782 | -0.657 | -0.56 |
| -1.154999999999993 | -0.783 | -0.658 | -0.561 |
| -1.151999999999993 | -0.785 | -0.659 | -0.562 |
| -1.148999999999993 | -0.787 | -0.661 | -0.563 |
| -1.145999999999993 | -0.788 | -0.662 | -0.563 |
| -1.142999999999993 | -0.79 | -0.663 | -0.564 |
| -1.139999999999993 | -0.792 | -0.664 | -0.565 |
| -1.136999999999993 | -0.794 | -0.665 | -0.566 |
| -1.133999999999993 | -0.795 | -0.666 | -0.567 |
| -1.130999999999994 | -0.797 | -0.667 | -0.567 |
| -1.127999999999994 | -0.799 | -0.669 | -0.568 |
| -1.124999999999994 | -0.801 | -0.67 | -0.569 |
| -1.121999999999994 | -0.802 | -0.671 | -0.57 |
| -1.118999999999994 | -0.804 | -0.672 | -0.571 |
| -1.115999999999994 | -0.806 | -0.673 | -0.572 |
| -1.112999999999994 | -0.808 | -0.674 | -0.572 |
| -1.109999999999994 | -0.81 | -0.676 | -0.573 |
| -1.106999999999994 | -0.811 | -0.677 | -0.574 |
| -1.103999999999995 | -0.813 | -0.678 | -0.575 |
| -1.100999999999995 | -0.815 | -0.679 | -0.576 |
| -1.097999999999995 | -0.817 | -0.68 | -0.577 |
| -1.094999999999995 | -0.819 | -0.682 | -0.578 |
| -1.091999999999995 | -0.821 | -0.683 | -0.578 |
| -1.088999999999995 | -0.822 | -0.684 | -0.579 |
| -1.085999999999995 | -0.824 | -0.685 | -0.58 |
| -1.082999999999995 | -0.826 | -0.686 | -0.581 |
| -1.079999999999995 | -0.828 | -0.688 | -0.582 |
| -1.076999999999996 | -0.83 | -0.689 | -0.583 |
| -1.073999999999996 | -0.832 | -0.69 | -0.584 |
| -1.070999999999996 | -0.834 | -0.691 | -0.585 |
| -1.067999999999996 | -0.836 | -0.693 | -0.585 |
| -1.064999999999996 | -0.838 | -0.694 | -0.586 |
| -1.061999999999996 | -0.839 | -0.695 | -0.587 |
| -1.058999999999996 | -0.841 | -0.696 | -0.588 |
| -1.055999999999996 | -0.843 | -0.698 | -0.589 |
| -1.052999999999996 | -0.845 | -0.699 | -0.59 |
| -1.049999999999996 | -0.847 | -0.7 | -0.591 |
| -1.046999999999997 | -0.849 | -0.701 | -0.592 |
| -1.043999999999997 | -0.851 | -0.703 | -0.593 |
| -1.040999999999997 | -0.853 | -0.704 | -0.593 |
| -1.037999999999997 | -0.855 | -0.705 | -0.594 |
| -1.034999999999997 | -0.857 | -0.706 | -0.595 |
| -1.031999999999997 | -0.859 | -0.708 | -0.596 |
| -1.028999999999997 | -0.861 | -0.709 | -0.597 |
| -1.025999999999997 | -0.863 | -0.71 | -0.598 |
| -1.022999999999997 | -0.865 | -0.712 | -0.599 |
| -1.019999999999998 | -0.867 | -0.713 | -0.6 |
| -1.016999999999998 | -0.87 | -0.714 | -0.601 |
| -1.013999999999998 | -0.872 | -0.716 | -0.602 |
| -1.010999999999998 | -0.874 | -0.717 | -0.603 |
| -1.007999999999998 | -0.876 | -0.718 | -0.604 |
| -1.004999999999998 | -0.878 | -0.72 | -0.605 |
| -1.001999999999998 | -0.88 | -0.721 | -0.606 |
| -0.998999999999998 | -0.882 | -0.722 | -0.606 |
| -0.995999999999998 | -0.884 | -0.724 | -0.607 |
| -0.992999999999998 | -0.886 | -0.725 | -0.608 |
| -0.989999999999998 | -0.888 | -0.726 | -0.609 |
| -0.986999999999998 | -0.891 | -0.728 | -0.61 |
| -0.983999999999998 | -0.893 | -0.729 | -0.611 |
| -0.980999999999998 | -0.895 | -0.73 | -0.612 |
| -0.977999999999998 | -0.897 | -0.732 | -0.613 |
| -0.974999999999998 | -0.899 | -0.733 | -0.614 |
| -0.971999999999998 | -0.902 | -0.735 | -0.615 |
| -0.968999999999998 | -0.904 | -0.736 | -0.616 |
| -0.965999999999998 | -0.906 | -0.737 | -0.617 |
| -0.962999999999998 | -0.908 | -0.739 | -0.618 |
| -0.959999999999998 | -0.911 | -0.74 | -0.619 |
| -0.956999999999998 | -0.913 | -0.742 | -0.62 |
| -0.953999999999998 | -0.915 | -0.743 | -0.621 |
| -0.950999999999998 | -0.917 | -0.744 | -0.622 |
| -0.947999999999998 | -0.92 | -0.746 | -0.623 |
| -0.944999999999998 | -0.922 | -0.747 | -0.624 |
| -0.941999999999998 | -0.924 | -0.749 | -0.625 |
| -0.938999999999998 | -0.927 | -0.75 | -0.626 |
| -0.935999999999998 | -0.929 | -0.752 | -0.627 |
| -0.932999999999998 | -0.931 | -0.753 | -0.628 |
| -0.929999999999998 | -0.934 | -0.754 | -0.629 |
| -0.926999999999998 | -0.936 | -0.756 | -0.63 |
| -0.923999999999998 | -0.938 | -0.757 | -0.631 |
| -0.920999999999998 | -0.941 | -0.759 | -0.632 |
| -0.917999999999998 | -0.943 | -0.76 | -0.633 |
| -0.914999999999998 | -0.946 | -0.762 | -0.634 |
| -0.911999999999998 | -0.948 | -0.763 | -0.635 |
| -0.908999999999998 | -0.95 | -0.765 | -0.636 |
| -0.905999999999998 | -0.953 | -0.766 | -0.638 |
| -0.902999999999998 | -0.955 | -0.768 | -0.639 |
| -0.899999999999998 | -0.958 | -0.769 | -0.64 |
| -0.896999999999998 | -0.96 | -0.771 | -0.641 |
| -0.893999999999998 | -0.963 | -0.772 | -0.642 |
| -0.890999999999998 | -0.965 | -0.774 | -0.643 |
| -0.887999999999998 | -0.968 | -0.776 | -0.644 |
| -0.884999999999998 | -0.97 | -0.777 | -0.645 |
| -0.881999999999998 | -0.973 | -0.779 | -0.646 |
| -0.878999999999998 | -0.975 | -0.78 | -0.647 |
| -0.875999999999998 | -0.978 | -0.782 | -0.648 |
| -0.872999999999998 | -0.981 | -0.783 | -0.649 |
| -0.869999999999998 | -0.983 | -0.785 | -0.65 |
| -0.866999999999998 | -0.986 | -0.786 | -0.652 |
| -0.863999999999998 | -0.988 | -0.788 | -0.653 |
| -0.860999999999998 | -0.991 | -0.79 | -0.654 |
| -0.857999999999998 | -0.994 | -0.791 | -0.655 |
| -0.854999999999998 | -0.996 | -0.793 | -0.656 |
| -0.851999999999998 | -0.999 | -0.795 | -0.657 |
| -0.848999999999998 | -1.002 | -0.796 | -0.658 |
| -0.845999999999998 | -1.004 | -0.798 | -0.659 |
| -0.842999999999998 | -1.007 | -0.799 | -0.661 |
| -0.839999999999998 | -1.01 | -0.801 | -0.662 |
| -0.836999999999998 | -1.013 | -0.803 | -0.663 |
| -0.833999999999998 | -1.015 | -0.804 | -0.664 |
| -0.830999999999998 | -1.018 | -0.806 | -0.665 |
| -0.827999999999998 | -1.021 | -0.808 | -0.666 |
| -0.824999999999998 | -1.024 | -0.809 | -0.668 |
| -0.821999999999998 | -1.027 | -0.811 | -0.669 |
| -0.818999999999998 | -1.029 | -0.813 | -0.67 |
| -0.815999999999998 | -1.032 | -0.814 | -0.671 |
| -0.812999999999998 | -1.035 | -0.816 | -0.672 |
| -0.809999999999998 | -1.038 | -0.818 | -0.673 |
| -0.806999999999998 | -1.041 | -0.82 | -0.675 |
| -0.803999999999998 | -1.044 | -0.821 | -0.676 |
| -0.800999999999998 | -1.047 | -0.823 | -0.677 |
| -0.797999999999998 | -1.05 | -0.825 | -0.678 |
| -0.794999999999998 | -1.052 | -0.827 | -0.679 |
| -0.791999999999998 | -1.055 | -0.828 | -0.681 |
| -0.788999999999998 | -1.058 | -0.83 | -0.682 |
| -0.785999999999998 | -1.061 | -0.832 | -0.683 |
| -0.782999999999998 | -1.064 | -0.834 | -0.684 |
| -0.779999999999998 | -1.067 | -0.835 | -0.686 |
| -0.776999999999998 | -1.071 | -0.837 | -0.687 |
| -0.773999999999998 | -1.074 | -0.839 | -0.688 |
| -0.770999999999998 | -1.077 | -0.841 | -0.689 |
| -0.767999999999998 | -1.08 | -0.843 | -0.691 |
| -0.764999999999998 | -1.083 | -0.844 | -0.692 |
| -0.761999999999998 | -1.086 | -0.846 | -0.693 |
| -0.758999999999998 | -1.089 | -0.848 | -0.694 |
| -0.755999999999998 | -1.092 | -0.85 | -0.696 |
| -0.752999999999998 | -1.095 | -0.852 | -0.697 |
| -0.749999999999998 | -1.099 | -0.854 | -0.698 |
| -0.746999999999998 | -1.102 | -0.856 | -0.7 |
| -0.743999999999998 | -1.105 | -0.857 | -0.701 |
| -0.740999999999998 | -1.108 | -0.859 | -0.702 |
| -0.737999999999998 | -1.112 | -0.861 | -0.703 |
| -0.734999999999998 | -1.115 | -0.863 | -0.705 |
| -0.731999999999998 | -1.118 | -0.865 | -0.706 |
| -0.728999999999998 | -1.121 | -0.867 | -0.707 |
| -0.725999999999998 | -1.125 | -0.869 | -0.709 |
| -0.722999999999998 | -1.128 | -0.871 | -0.71 |
| -0.719999999999998 | -1.132 | -0.873 | -0.711 |
| -0.716999999999998 | -1.135 | -0.875 | -0.713 |
| -0.713999999999998 | -1.138 | -0.877 | -0.714 |
| -0.710999999999998 | -1.142 | -0.879 | -0.716 |
| -0.707999999999998 | -1.145 | -0.881 | -0.717 |
| -0.704999999999998 | -1.149 | -0.883 | -0.718 |
| -0.701999999999998 | -1.152 | -0.885 | -0.72 |
| -0.698999999999998 | -1.156 | -0.887 | -0.721 |
| -0.695999999999998 | -1.159 | -0.889 | -0.722 |
| -0.692999999999998 | -1.163 | -0.891 | -0.724 |
| -0.689999999999998 | -1.166 | -0.893 | -0.725 |
| -0.686999999999998 | -1.17 | -0.895 | -0.727 |
| -0.683999999999998 | -1.173 | -0.897 | -0.728 |
| -0.680999999999998 | -1.177 | -0.899 | -0.73 |
| -0.677999999999998 | -1.181 | -0.901 | -0.731 |
| -0.674999999999998 | -1.184 | -0.903 | -0.732 |
| -0.671999999999998 | -1.188 | -0.905 | -0.734 |
| -0.668999999999998 | -1.192 | -0.908 | -0.735 |
| -0.665999999999998 | -1.196 | -0.91 | -0.737 |
| -0.662999999999998 | -1.199 | -0.912 | -0.738 |
| -0.659999999999998 | -1.203 | -0.914 | -0.74 |
| -0.656999999999998 | -1.207 | -0.916 | -0.741 |
| -0.653999999999998 | -1.211 | -0.918 | -0.743 |
| -0.650999999999998 | -1.215 | -0.921 | -0.744 |
| -0.647999999999998 | -1.218 | -0.923 | -0.746 |
| -0.644999999999998 | -1.222 | -0.925 | -0.747 |
| -0.641999999999998 | -1.226 | -0.927 | -0.749 |
| -0.638999999999998 | -1.23 | -0.929 | -0.75 |
| -0.635999999999998 | -1.234 | -0.932 | -0.752 |
| -0.632999999999998 | -1.238 | -0.934 | -0.753 |
| -0.629999999999998 | -1.242 | -0.936 | -0.755 |
| -0.626999999999998 | -1.246 | -0.938 | -0.756 |
| -0.623999999999998 | -1.25 | -0.941 | -0.758 |
| -0.620999999999998 | -1.254 | -0.943 | -0.76 |
| -0.617999999999998 | -1.259 | -0.945 | -0.761 |
| -0.614999999999998 | -1.263 | -0.948 | -0.763 |
| -0.611999999999998 | -1.267 | -0.95 | -0.764 |
| -0.608999999999998 | -1.271 | -0.952 | -0.766 |
| -0.605999999999998 | -1.275 | -0.955 | -0.768 |
| -0.602999999999998 | -1.28 | -0.957 | -0.769 |
| -0.599999999999998 | -1.284 | -0.959 | -0.771 |
| -0.596999999999998 | -1.288 | -0.962 | -0.772 |
| -0.593999999999998 | -1.292 | -0.964 | -0.774 |
| -0.590999999999998 | -1.297 | -0.967 | -0.776 |
| -0.587999999999998 | -1.301 | -0.969 | -0.777 |
| -0.584999999999998 | -1.306 | -0.972 | -0.779 |
| -0.581999999999998 | -1.31 | -0.974 | -0.781 |
| -0.578999999999998 | -1.314 | -0.977 | -0.782 |
| -0.575999999999998 | -1.319 | -0.979 | -0.784 |
| -0.572999999999998 | -1.324 | -0.982 | -0.786 |
| -0.569999999999998 | -1.328 | -0.984 | -0.788 |
| -0.566999999999998 | -1.333 | -0.987 | -0.789 |
| -0.563999999999998 | -1.337 | -0.989 | -0.791 |
| -0.560999999999998 | -1.342 | -0.992 | -0.793 |
| -0.557999999999998 | -1.347 | -0.994 | -0.795 |
| -0.554999999999998 | -1.351 | -0.997 | -0.796 |
| -0.551999999999998 | -1.356 | -1 | -0.798 |
| -0.548999999999998 | -1.361 | -1.002 | -0.8 |
| -0.545999999999998 | -1.366 | -1.005 | -0.802 |
| -0.542999999999998 | -1.37 | -1.007 | -0.803 |
| -0.539999999999998 | -1.375 | -1.01 | -0.805 |
| -0.536999999999998 | -1.38 | -1.013 | -0.807 |
| -0.533999999999998 | -1.385 | -1.016 | -0.809 |
| -0.530999999999998 | -1.39 | -1.018 | -0.811 |
| -0.527999999999998 | -1.395 | -1.021 | -0.813 |
| -0.524999999999998 | -1.4 | -1.024 | -0.815 |
| -0.521999999999998 | -1.405 | -1.026 | -0.816 |
| -0.518999999999998 | -1.41 | -1.029 | -0.818 |
| -0.515999999999998 | -1.416 | -1.032 | -0.82 |
| -0.512999999999998 | -1.421 | -1.035 | -0.822 |
| -0.509999999999998 | -1.426 | -1.038 | -0.824 |
| -0.506999999999998 | -1.431 | -1.041 | -0.826 |
| -0.503999999999998 | -1.437 | -1.043 | -0.828 |
| -0.500999999999998 | -1.442 | -1.046 | -0.83 |
| -0.497999999999998 | -1.447 | -1.049 | -0.832 |
| -0.494999999999998 | -1.453 | -1.052 | -0.834 |
| -0.491999999999998 | -1.458 | -1.055 | -0.836 |
| -0.488999999999998 | -1.464 | -1.058 | -0.838 |
| -0.485999999999998 | -1.469 | -1.061 | -0.84 |
| -0.482999999999998 | -1.475 | -1.064 | -0.842 |
| -0.479999999999998 | -1.48 | -1.067 | -0.844 |
| -0.476999999999998 | -1.486 | -1.07 | -0.846 |
| -0.473999999999998 | -1.492 | -1.073 | -0.848 |
| -0.470999999999998 | -1.497 | -1.076 | -0.85 |
| -0.467999999999998 | -1.503 | -1.079 | -0.852 |
| -0.464999999999998 | -1.509 | -1.083 | -0.854 |
| -0.461999999999998 | -1.515 | -1.086 | -0.857 |
| -0.458999999999998 | -1.521 | -1.089 | -0.859 |
| -0.455999999999998 | -1.527 | -1.092 | -0.861 |
| -0.452999999999998 | -1.533 | -1.095 | -0.863 |
| -0.449999999999998 | -1.539 | -1.099 | -0.865 |
| -0.446999999999998 | -1.545 | -1.102 | -0.867 |
| -0.443999999999998 | -1.551 | -1.105 | -0.87 |
| -0.440999999999998 | -1.557 | -1.108 | -0.872 |
| -0.437999999999998 | -1.564 | -1.112 | -0.874 |
| -0.434999999999998 | -1.57 | -1.115 | -0.876 |
| -0.431999999999998 | -1.576 | -1.119 | -0.879 |
| -0.428999999999998 | -1.583 | -1.122 | -0.881 |
| -0.425999999999998 | -1.589 | -1.125 | -0.883 |
| -0.422999999999998 | -1.596 | -1.129 | -0.886 |
| -0.419999999999998 | -1.602 | -1.132 | -0.888 |
| -0.416999999999998 | -1.609 | -1.136 | -0.89 |
| -0.413999999999998 | -1.615 | -1.139 | -0.893 |
| -0.410999999999998 | -1.622 | -1.143 | -0.895 |
| -0.407999999999998 | -1.629 | -1.147 | -0.898 |
| -0.404999999999998 | -1.636 | -1.15 | -0.9 |
| -0.401999999999998 | -1.643 | -1.154 | -0.903 |
| -0.398999999999998 | -1.65 | -1.157 | -0.905 |
| -0.395999999999998 | -1.657 | -1.161 | -0.907 |
| -0.392999999999998 | -1.664 | -1.165 | -0.91 |
| -0.389999999999998 | -1.671 | -1.169 | -0.913 |
| -0.386999999999998 | -1.678 | -1.172 | -0.915 |
| -0.383999999999998 | -1.685 | -1.176 | -0.918 |
| -0.380999999999998 | -1.693 | -1.18 | -0.92 |
| -0.377999999999998 | -1.7 | -1.184 | -0.923 |
| -0.374999999999998 | -1.707 | -1.188 | -0.925 |
| -0.371999999999998 | -1.715 | -1.192 | -0.928 |
| -0.368999999999998 | -1.723 | -1.196 | -0.931 |
| -0.365999999999998 | -1.73 | -1.2 | -0.934 |
| -0.362999999999998 | -1.738 | -1.204 | -0.936 |
| -0.359999999999998 | -1.746 | -1.208 | -0.939 |
| -0.356999999999998 | -1.754 | -1.212 | -0.942 |
| -0.353999999999998 | -1.762 | -1.216 | -0.945 |
| -0.350999999999998 | -1.77 | -1.22 | -0.947 |
| -0.347999999999998 | -1.778 | -1.225 | -0.95 |
| -0.344999999999998 | -1.786 | -1.229 | -0.953 |
| -0.341999999999998 | -1.794 | -1.233 | -0.956 |
| -0.338999999999998 | -1.802 | -1.238 | -0.959 |
| -0.335999999999998 | -1.811 | -1.242 | -0.962 |
| -0.332999999999998 | -1.819 | -1.246 | -0.965 |
| -0.329999999999998 | -1.828 | -1.251 | -0.968 |
| -0.326999999999998 | -1.837 | -1.255 | -0.971 |
| -0.323999999999998 | -1.845 | -1.26 | -0.974 |
| -0.320999999999998 | -1.854 | -1.264 | -0.977 |
| -0.317999999999998 | -1.863 | -1.269 | -0.98 |
| -0.314999999999998 | -1.872 | -1.274 | -0.983 |
| -0.311999999999998 | -1.881 | -1.279 | -0.986 |
| -0.308999999999998 | -1.891 | -1.283 | -0.99 |
| -0.305999999999998 | -1.9 | -1.288 | -0.993 |
| -0.302999999999998 | -1.909 | -1.293 | -0.996 |
| -0.299999999999998 | -1.919 | -1.298 | -0.999 |
| -0.296999999999998 | -1.929 | -1.303 | -1.003 |
| -0.293999999999998 | -1.938 | -1.308 | -1.006 |
| -0.290999999999998 | -1.948 | -1.313 | -1.01 |
| -0.287999999999998 | -1.958 | -1.318 | -1.013 |
| -0.284999999999998 | -1.968 | -1.323 | -1.016 |
| -0.281999999999998 | -1.978 | -1.329 | -1.02 |
| -0.278999999999998 | -1.989 | -1.334 | -1.023 |
| -0.275999999999998 | -1.999 | -1.339 | -1.027 |
| -0.272999999999998 | -2.01 | -1.345 | -1.031 |
| -0.269999999999998 | -2.02 | -1.35 | -1.034 |
| -0.266999999999998 | -2.031 | -1.356 | -1.038 |
| -0.263999999999998 | -2.042 | -1.361 | -1.042 |
| -0.260999999999998 | -2.053 | -1.367 | -1.046 |
| -0.257999999999998 | -2.064 | -1.373 | -1.049 |
| -0.254999999999998 | -2.076 | -1.378 | -1.053 |
| -0.251999999999998 | -2.087 | -1.384 | -1.057 |
| -0.248999999999998 | -2.099 | -1.39 | -1.061 |
| -0.245999999999998 | -2.11 | -1.396 | -1.065 |
| -0.242999999999998 | -2.122 | -1.402 | -1.069 |
| -0.239999999999998 | -2.134 | -1.408 | -1.073 |
| -0.236999999999998 | -2.147 | -1.415 | -1.078 |
| -0.233999999999998 | -2.159 | -1.421 | -1.082 |
| -0.230999999999998 | -2.172 | -1.427 | -1.086 |
| -0.227999999999998 | -2.184 | -1.434 | -1.091 |
| -0.224999999999998 | -2.197 | -1.441 | -1.095 |
| -0.221999999999998 | -2.21 | -1.447 | -1.099 |
| -0.218999999999998 | -2.224 | -1.454 | -1.104 |
| -0.215999999999998 | -2.237 | -1.461 | -1.109 |
| -0.212999999999998 | -2.251 | -1.468 | -1.113 |
| -0.209999999999998 | -2.265 | -1.475 | -1.118 |
| -0.206999999999998 | -2.279 | -1.482 | -1.123 |
| -0.203999999999998 | -2.293 | -1.489 | -1.128 |
| -0.200999999999998 | -2.308 | -1.497 | -1.132 |
| -0.197999999999997 | -2.322 | -1.504 | -1.137 |
| -0.194999999999997 | -2.337 | -1.512 | -1.143 |
| -0.191999999999997 | -2.352 | -1.519 | -1.148 |
| -0.188999999999997 | -2.368 | -1.527 | -1.153 |
| -0.185999999999997 | -2.384 | -1.535 | -1.158 |
| -0.182999999999997 | -2.4 | -1.543 | -1.164 |
| -0.179999999999997 | -2.416 | -1.552 | -1.169 |
| -0.176999999999997 | -2.432 | -1.56 | -1.175 |
| -0.173999999999997 | -2.449 | -1.568 | -1.18 |
| -0.170999999999997 | -2.466 | -1.577 | -1.186 |
| -0.167999999999997 | -2.484 | -1.586 | -1.192 |
| -0.164999999999997 | -2.502 | -1.595 | -1.198 |
| -0.161999999999997 | -2.52 | -1.604 | -1.204 |
| -0.158999999999997 | -2.538 | -1.613 | -1.21 |
| -0.155999999999997 | -2.557 | -1.623 | -1.217 |
| -0.152999999999997 | -2.576 | -1.633 | -1.223 |
| -0.149999999999997 | -2.596 | -1.642 | -1.23 |
| -0.146999999999997 | -2.616 | -1.652 | -1.237 |
| -0.143999999999997 | -2.636 | -1.663 | -1.243 |
| -0.140999999999997 | -2.657 | -1.673 | -1.25 |
| -0.137999999999997 | -2.678 | -1.684 | -1.258 |
| -0.134999999999997 | -2.7 | -1.695 | -1.265 |
| -0.131999999999997 | -2.722 | -1.706 | -1.272 |
| -0.128999999999997 | -2.745 | -1.718 | -1.28 |
| -0.125999999999997 | -2.769 | -1.729 | -1.288 |
| -0.122999999999997 | -2.792 | -1.741 | -1.296 |
| -0.119999999999997 | -2.817 | -1.754 | -1.304 |
| -0.116999999999997 | -2.842 | -1.766 | -1.313 |
| -0.113999999999997 | -2.868 | -1.779 | -1.321 |
| -0.110999999999997 | -2.894 | -1.793 | -1.33 |
| -0.107999999999997 | -2.922 | -1.806 | -1.339 |
| -0.104999999999997 | -2.95 | -1.82 | -1.349 |
| -0.101999999999997 | -2.979 | -1.835 | -1.358 |
| -0.0989999999999974 | -3.008 | -1.85 | -1.368 |
| -0.0959999999999974 | -3.039 | -1.865 | -1.378 |
| -0.0929999999999974 | -3.07 | -1.881 | -1.389 |
| -0.0899999999999974 | -3.103 | -1.897 | -1.4 |
| -0.0869999999999974 | -3.137 | -1.914 | -1.411 |
| -0.0839999999999974 | -3.172 | -1.932 | -1.423 |
| -0.0809999999999974 | -3.208 | -1.95 | -1.435 |
| -0.0779999999999974 | -3.246 | -1.969 | -1.448 |
| -0.0749999999999974 | -3.285 | -1.988 | -1.461 |
| -0.0719999999999974 | -3.326 | -2.009 | -1.474 |
| -0.0689999999999974 | -3.368 | -2.03 | -1.489 |
| -0.0659999999999974 | -3.412 | -2.052 | -1.503 |
| -0.0629999999999974 | -3.459 | -2.076 | -1.519 |
| -0.0599999999999974 | -3.507 | -2.1 | -1.535 |
| -0.0569999999999974 | -3.559 | -2.126 | -1.552 |
| -0.0539999999999974 | -3.613 | -2.153 | -1.57 |
| -0.0509999999999974 | -3.67 | -2.181 | -1.589 |
| -0.0479999999999974 | -3.73 | -2.211 | -1.609 |
| -0.0449999999999974 | -3.795 | -2.244 | -1.631 |
| -0.0419999999999974 | -3.864 | -2.278 | -1.654 |
| -0.0389999999999974 | -3.938 | -2.315 | -1.679 |
| -0.0359999999999974 | -4.018 | -2.355 | -1.705 |
| -0.0329999999999974 | -4.105 | -2.399 | -1.734 |
| -0.0299999999999974 | -4.2 | -2.446 | -1.766 |
| -0.0269999999999974 | -4.305 | -2.499 | -1.801 |
| -0.0239999999999974 | -4.423 | -2.558 | -1.84 |
| -0.0209999999999974 | -4.556 | -2.625 | -1.885 |
| -0.0179999999999974 | -4.711 | -2.702 | -1.936 |
| -0.0149999999999974 | -4.893 | -2.793 | -1.997 |
| -0.0119999999999974 | -5.116 | -2.905 | -2.072 |
| -0.00899999999999737 | -5.404 | -3.048 | -2.167 |
| -0.00599999999999737 | -5.809 | -3.251 | -2.303 |
| -0.00299999999999737 | -6.502 | -3.598 | -2.534 |
| 2.62897342784285e-15 | -34.265 | -17.479 | -11.788 |
| 0.00300000000000263 | -6.502 | -3.598 | -2.534 |
| 0.00600000000000263 | -5.809 | -3.251 | -2.303 |
| 0.00900000000000263 | -5.404 | -3.048 | -2.167 |
| 0.0120000000000026 | -5.116 | -2.905 | -2.072 |
| 0.0150000000000026 | -4.893 | -2.793 | -1.997 |
| 0.0180000000000026 | -4.711 | -2.702 | -1.936 |
| 0.0210000000000026 | -4.556 | -2.625 | -1.885 |
| 0.0240000000000026 | -4.423 | -2.558 | -1.84 |
| 0.0270000000000026 | -4.305 | -2.499 | -1.801 |
| 0.0300000000000026 | -4.2 | -2.446 | -1.766 |
| 0.0330000000000026 | -4.105 | -2.399 | -1.734 |
| 0.0360000000000026 | -4.018 | -2.355 | -1.705 |
| 0.0390000000000026 | -3.938 | -2.315 | -1.679 |
| 0.0420000000000026 | -3.864 | -2.278 | -1.654 |
| 0.0450000000000026 | -3.795 | -2.244 | -1.631 |
| 0.0480000000000026 | -3.73 | -2.211 | -1.609 |
| 0.0510000000000026 | -3.67 | -2.181 | -1.589 |
| 0.0540000000000026 | -3.613 | -2.153 | -1.57 |
| 0.0570000000000026 | -3.559 | -2.126 | -1.552 |
| 0.0600000000000026 | -3.507 | -2.1 | -1.535 |
| 0.0630000000000026 | -3.459 | -2.076 | -1.519 |
| 0.0660000000000026 | -3.412 | -2.052 | -1.503 |
| 0.0690000000000026 | -3.368 | -2.03 | -1.489 |
| 0.0720000000000027 | -3.326 | -2.009 | -1.474 |
| 0.0750000000000027 | -3.285 | -1.988 | -1.461 |
| 0.0780000000000027 | -3.246 | -1.969 | -1.448 |
| 0.0810000000000027 | -3.208 | -1.95 | -1.435 |
| 0.0840000000000027 | -3.172 | -1.932 | -1.423 |
| 0.0870000000000027 | -3.137 | -1.914 | -1.411 |
| 0.0900000000000027 | -3.103 | -1.897 | -1.4 |
| 0.0930000000000027 | -3.07 | -1.881 | -1.389 |
| 0.0960000000000027 | -3.039 | -1.865 | -1.378 |
| 0.0990000000000027 | -3.008 | -1.85 | -1.368 |
| 0.102000000000003 | -2.979 | -1.835 | -1.358 |
| 0.105000000000003 | -2.95 | -1.82 | -1.349 |
| 0.108000000000003 | -2.922 | -1.806 | -1.339 |
| 0.111000000000003 | -2.894 | -1.793 | -1.33 |
| 0.114000000000003 | -2.868 | -1.779 | -1.321 |
| 0.117000000000003 | -2.842 | -1.766 | -1.313 |
| 0.120000000000003 | -2.817 | -1.754 | -1.304 |
| 0.123000000000003 | -2.792 | -1.741 | -1.296 |
| 0.126000000000003 | -2.769 | -1.729 | -1.288 |
| 0.129000000000003 | -2.745 | -1.718 | -1.28 |
| 0.132000000000003 | -2.722 | -1.706 | -1.272 |
| 0.135000000000003 | -2.7 | -1.695 | -1.265 |
| 0.138000000000003 | -2.678 | -1.684 | -1.258 |
| 0.141000000000003 | -2.657 | -1.673 | -1.25 |
| 0.144000000000003 | -2.636 | -1.663 | -1.243 |
| 0.147000000000003 | -2.616 | -1.652 | -1.237 |
| 0.150000000000003 | -2.596 | -1.642 | -1.23 |
| 0.153000000000003 | -2.576 | -1.633 | -1.223 |
| 0.156000000000003 | -2.557 | -1.623 | -1.217 |
| 0.159000000000003 | -2.538 | -1.613 | -1.21 |
| 0.162000000000003 | -2.52 | -1.604 | -1.204 |
| 0.165000000000003 | -2.502 | -1.595 | -1.198 |
| 0.168000000000003 | -2.484 | -1.586 | -1.192 |
| 0.171000000000003 | -2.466 | -1.577 | -1.186 |
| 0.174000000000003 | -2.449 | -1.568 | -1.18 |
| 0.177000000000003 | -2.432 | -1.56 | -1.175 |
| 0.180000000000003 | -2.416 | -1.552 | -1.169 |
| 0.183000000000003 | -2.4 | -1.543 | -1.164 |
| 0.186000000000003 | -2.384 | -1.535 | -1.158 |
| 0.189000000000003 | -2.368 | -1.527 | -1.153 |
| 0.192000000000003 | -2.352 | -1.519 | -1.148 |
| 0.195000000000003 | -2.337 | -1.512 | -1.143 |
| 0.198000000000003 | -2.322 | -1.504 | -1.137 |
| 0.201000000000003 | -2.308 | -1.497 | -1.132 |
| 0.204000000000003 | -2.293 | -1.489 | -1.128 |
| 0.207000000000003 | -2.279 | -1.482 | -1.123 |
| 0.210000000000003 | -2.265 | -1.475 | -1.118 |
| 0.213000000000003 | -2.251 | -1.468 | -1.113 |
| 0.216000000000003 | -2.237 | -1.461 | -1.109 |
| 0.219000000000003 | -2.224 | -1.454 | -1.104 |
| 0.222000000000003 | -2.21 | -1.447 | -1.099 |
| 0.225000000000003 | -2.197 | -1.441 | -1.095 |
| 0.228000000000003 | -2.184 | -1.434 | -1.091 |
| 0.231000000000003 | -2.172 | -1.427 | -1.086 |
| 0.234000000000003 | -2.159 | -1.421 | -1.082 |
| 0.237000000000003 | -2.147 | -1.415 | -1.078 |
| 0.240000000000003 | -2.134 | -1.408 | -1.073 |
| 0.243000000000003 | -2.122 | -1.402 | -1.069 |
| 0.246000000000003 | -2.11 | -1.396 | -1.065 |
| 0.249000000000003 | -2.099 | -1.39 | -1.061 |
| 0.252000000000003 | -2.087 | -1.384 | -1.057 |
| 0.255000000000003 | -2.076 | -1.378 | -1.053 |
| 0.258000000000003 | -2.064 | -1.373 | -1.049 |
| 0.261000000000003 | -2.053 | -1.367 | -1.046 |
| 0.264000000000003 | -2.042 | -1.361 | -1.042 |
| 0.267000000000003 | -2.031 | -1.356 | -1.038 |
| 0.270000000000003 | -2.02 | -1.35 | -1.034 |
| 0.273000000000003 | -2.01 | -1.345 | -1.031 |
| 0.276000000000003 | -1.999 | -1.339 | -1.027 |
| 0.279000000000003 | -1.989 | -1.334 | -1.023 |
| 0.282000000000003 | -1.978 | -1.329 | -1.02 |
| 0.285000000000003 | -1.968 | -1.323 | -1.016 |
| 0.288000000000003 | -1.958 | -1.318 | -1.013 |
| 0.291000000000003 | -1.948 | -1.313 | -1.01 |
| 0.294000000000003 | -1.938 | -1.308 | -1.006 |
| 0.297000000000003 | -1.929 | -1.303 | -1.003 |
| 0.300000000000003 | -1.919 | -1.298 | -0.999 |
| 0.303000000000003 | -1.909 | -1.293 | -0.996 |
| 0.306000000000003 | -1.9 | -1.288 | -0.993 |
| 0.309000000000003 | -1.891 | -1.283 | -0.99 |
| 0.312000000000003 | -1.881 | -1.279 | -0.986 |
| 0.315000000000003 | -1.872 | -1.274 | -0.983 |
| 0.318000000000003 | -1.863 | -1.269 | -0.98 |
| 0.321000000000003 | -1.854 | -1.264 | -0.977 |
| 0.324000000000003 | -1.845 | -1.26 | -0.974 |
| 0.327000000000003 | -1.837 | -1.255 | -0.971 |
| 0.330000000000003 | -1.828 | -1.251 | -0.968 |
| 0.333000000000003 | -1.819 | -1.246 | -0.965 |
| 0.336000000000003 | -1.811 | -1.242 | -0.962 |
| 0.339000000000003 | -1.802 | -1.238 | -0.959 |
| 0.342000000000003 | -1.794 | -1.233 | -0.956 |
| 0.345000000000003 | -1.786 | -1.229 | -0.953 |
| 0.348000000000003 | -1.778 | -1.225 | -0.95 |
| 0.351000000000003 | -1.77 | -1.22 | -0.947 |
| 0.354000000000003 | -1.762 | -1.216 | -0.945 |
| 0.357000000000003 | -1.754 | -1.212 | -0.942 |
| 0.360000000000003 | -1.746 | -1.208 | -0.939 |
| 0.363000000000003 | -1.738 | -1.204 | -0.936 |
| 0.366000000000003 | -1.73 | -1.2 | -0.934 |
| 0.369000000000003 | -1.723 | -1.196 | -0.931 |
| 0.372000000000003 | -1.715 | -1.192 | -0.928 |
| 0.375000000000003 | -1.707 | -1.188 | -0.925 |
| 0.378000000000003 | -1.7 | -1.184 | -0.923 |
| 0.381000000000003 | -1.693 | -1.18 | -0.92 |
| 0.384000000000003 | -1.685 | -1.176 | -0.918 |
| 0.387000000000003 | -1.678 | -1.172 | -0.915 |
| 0.390000000000003 | -1.671 | -1.169 | -0.913 |
| 0.393000000000003 | -1.664 | -1.165 | -0.91 |
| 0.396000000000003 | -1.657 | -1.161 | -0.907 |
| 0.399000000000003 | -1.65 | -1.157 | -0.905 |
| 0.402000000000003 | -1.643 | -1.154 | -0.903 |
| 0.405000000000003 | -1.636 | -1.15 | -0.9 |
| 0.408000000000003 | -1.629 | -1.147 | -0.898 |
| 0.411000000000003 | -1.622 | -1.143 | -0.895 |
| 0.414000000000003 | -1.615 | -1.139 | -0.893 |
| 0.417000000000003 | -1.609 | -1.136 | -0.89 |
| 0.420000000000003 | -1.602 | -1.132 | -0.888 |
| 0.423000000000003 | -1.596 | -1.129 | -0.886 |
| 0.426000000000003 | -1.589 | -1.125 | -0.883 |
| 0.429000000000003 | -1.583 | -1.122 | -0.881 |
| 0.432000000000003 | -1.576 | -1.119 | -0.879 |
| 0.435000000000003 | -1.57 | -1.115 | -0.876 |
| 0.438000000000003 | -1.564 | -1.112 | -0.874 |
| 0.441000000000003 | -1.557 | -1.108 | -0.872 |
| 0.444000000000003 | -1.551 | -1.105 | -0.87 |
| 0.447000000000003 | -1.545 | -1.102 | -0.867 |
| 0.450000000000003 | -1.539 | -1.099 | -0.865 |
| 0.453000000000003 | -1.533 | -1.095 | -0.863 |
| 0.456000000000003 | -1.527 | -1.092 | -0.861 |
| 0.459000000000003 | -1.521 | -1.089 | -0.859 |
| 0.462000000000003 | -1.515 | -1.086 | -0.857 |
| 0.465000000000003 | -1.509 | -1.083 | -0.854 |
| 0.468000000000003 | -1.503 | -1.079 | -0.852 |
| 0.471000000000003 | -1.497 | -1.076 | -0.85 |
| 0.474000000000003 | -1.492 | -1.073 | -0.848 |
| 0.477000000000003 | -1.486 | -1.07 | -0.846 |
| 0.480000000000003 | -1.48 | -1.067 | -0.844 |
| 0.483000000000003 | -1.475 | -1.064 | -0.842 |
| 0.486000000000003 | -1.469 | -1.061 | -0.84 |
| 0.489000000000003 | -1.464 | -1.058 | -0.838 |
| 0.492000000000003 | -1.458 | -1.055 | -0.836 |
| 0.495000000000003 | -1.453 | -1.052 | -0.834 |
| 0.498000000000003 | -1.447 | -1.049 | -0.832 |
| 0.501000000000003 | -1.442 | -1.046 | -0.83 |
| 0.504000000000003 | -1.437 | -1.043 | -0.828 |
| 0.507000000000003 | -1.431 | -1.041 | -0.826 |
| 0.510000000000003 | -1.426 | -1.038 | -0.824 |
| 0.513000000000003 | -1.421 | -1.035 | -0.822 |
| 0.516000000000003 | -1.416 | -1.032 | -0.82 |
| 0.519000000000003 | -1.41 | -1.029 | -0.818 |
| 0.522000000000003 | -1.405 | -1.026 | -0.816 |
| 0.525000000000003 | -1.4 | -1.024 | -0.815 |
| 0.528000000000003 | -1.395 | -1.021 | -0.813 |
| 0.531000000000003 | -1.39 | -1.018 | -0.811 |
| 0.534000000000003 | -1.385 | -1.016 | -0.809 |
| 0.537000000000003 | -1.38 | -1.013 | -0.807 |
| 0.540000000000003 | -1.375 | -1.01 | -0.805 |
| 0.543000000000003 | -1.37 | -1.007 | -0.803 |
| 0.546000000000003 | -1.366 | -1.005 | -0.802 |
| 0.549000000000003 | -1.361 | -1.002 | -0.8 |
| 0.552000000000003 | -1.356 | -1 | -0.798 |
| 0.555000000000003 | -1.351 | -0.997 | -0.796 |
| 0.558000000000003 | -1.347 | -0.994 | -0.795 |
| 0.561000000000003 | -1.342 | -0.992 | -0.793 |
| 0.564000000000003 | -1.337 | -0.989 | -0.791 |
| 0.567000000000003 | -1.333 | -0.987 | -0.789 |
| 0.570000000000003 | -1.328 | -0.984 | -0.788 |
| 0.573000000000003 | -1.324 | -0.982 | -0.786 |
| 0.576000000000003 | -1.319 | -0.979 | -0.784 |
| 0.579000000000003 | -1.314 | -0.977 | -0.782 |
| 0.582000000000003 | -1.31 | -0.974 | -0.781 |
| 0.585000000000003 | -1.306 | -0.972 | -0.779 |
| 0.588000000000003 | -1.301 | -0.969 | -0.777 |
| 0.591000000000003 | -1.297 | -0.967 | -0.776 |
| 0.594000000000003 | -1.292 | -0.964 | -0.774 |
| 0.597000000000003 | -1.288 | -0.962 | -0.772 |
| 0.600000000000003 | -1.284 | -0.959 | -0.771 |
| 0.603000000000003 | -1.28 | -0.957 | -0.769 |
| 0.606000000000003 | -1.275 | -0.955 | -0.768 |
| 0.609000000000003 | -1.271 | -0.952 | -0.766 |
| 0.612000000000003 | -1.267 | -0.95 | -0.764 |
| 0.615000000000003 | -1.263 | -0.948 | -0.763 |
| 0.618000000000003 | -1.259 | -0.945 | -0.761 |
| 0.621000000000003 | -1.254 | -0.943 | -0.76 |
| 0.624000000000003 | -1.25 | -0.941 | -0.758 |
| 0.627000000000003 | -1.246 | -0.938 | -0.756 |
| 0.630000000000003 | -1.242 | -0.936 | -0.755 |
| 0.633000000000003 | -1.238 | -0.934 | -0.753 |
| 0.636000000000003 | -1.234 | -0.932 | -0.752 |
| 0.639000000000003 | -1.23 | -0.929 | -0.75 |
| 0.642000000000003 | -1.226 | -0.927 | -0.749 |
| 0.645000000000003 | -1.222 | -0.925 | -0.747 |
| 0.648000000000003 | -1.218 | -0.923 | -0.746 |
| 0.651000000000003 | -1.215 | -0.921 | -0.744 |
| 0.654000000000003 | -1.211 | -0.918 | -0.743 |
| 0.657000000000003 | -1.207 | -0.916 | -0.741 |
| 0.660000000000003 | -1.203 | -0.914 | -0.74 |
| 0.663000000000003 | -1.199 | -0.912 | -0.738 |
| 0.666000000000003 | -1.196 | -0.91 | -0.737 |
| 0.669000000000003 | -1.192 | -0.908 | -0.735 |
| 0.672000000000003 | -1.188 | -0.905 | -0.734 |
| 0.675000000000003 | -1.184 | -0.903 | -0.732 |
| 0.678000000000003 | -1.181 | -0.901 | -0.731 |
| 0.681000000000003 | -1.177 | -0.899 | -0.73 |
| 0.684000000000003 | -1.173 | -0.897 | -0.728 |
| 0.687000000000003 | -1.17 | -0.895 | -0.727 |
| 0.690000000000003 | -1.166 | -0.893 | -0.725 |
| 0.693000000000003 | -1.163 | -0.891 | -0.724 |
| 0.696000000000003 | -1.159 | -0.889 | -0.722 |
| 0.699000000000003 | -1.156 | -0.887 | -0.721 |
| 0.702000000000003 | -1.152 | -0.885 | -0.72 |
| 0.705000000000003 | -1.149 | -0.883 | -0.718 |
| 0.708000000000003 | -1.145 | -0.881 | -0.717 |
| 0.711000000000003 | -1.142 | -0.879 | -0.716 |
| 0.714000000000003 | -1.138 | -0.877 | -0.714 |
| 0.717000000000003 | -1.135 | -0.875 | -0.713 |
| 0.720000000000003 | -1.132 | -0.873 | -0.711 |
| 0.723000000000003 | -1.128 | -0.871 | -0.71 |
| 0.726000000000003 | -1.125 | -0.869 | -0.709 |
| 0.729000000000003 | -1.121 | -0.867 | -0.707 |
| 0.732000000000003 | -1.118 | -0.865 | -0.706 |
| 0.735000000000003 | -1.115 | -0.863 | -0.705 |
| 0.738000000000003 | -1.112 | -0.861 | -0.703 |
| 0.741000000000003 | -1.108 | -0.859 | -0.702 |
| 0.744000000000003 | -1.105 | -0.857 | -0.701 |
| 0.747000000000003 | -1.102 | -0.856 | -0.7 |
| 0.750000000000003 | -1.099 | -0.854 | -0.698 |
| 0.753000000000003 | -1.095 | -0.852 | -0.697 |
| 0.756000000000003 | -1.092 | -0.85 | -0.696 |
| 0.759000000000003 | -1.089 | -0.848 | -0.694 |
| 0.762000000000003 | -1.086 | -0.846 | -0.693 |
| 0.765000000000003 | -1.083 | -0.844 | -0.692 |
| 0.768000000000003 | -1.08 | -0.843 | -0.691 |
| 0.771000000000003 | -1.077 | -0.841 | -0.689 |
| 0.774000000000003 | -1.074 | -0.839 | -0.688 |
| 0.777000000000003 | -1.071 | -0.837 | -0.687 |
| 0.780000000000003 | -1.067 | -0.835 | -0.686 |
| 0.783000000000003 | -1.064 | -0.834 | -0.684 |
| 0.786000000000003 | -1.061 | -0.832 | -0.683 |
| 0.789000000000003 | -1.058 | -0.83 | -0.682 |
| 0.792000000000003 | -1.055 | -0.828 | -0.681 |
| 0.795000000000003 | -1.052 | -0.827 | -0.679 |
| 0.798000000000003 | -1.05 | -0.825 | -0.678 |
| 0.801000000000003 | -1.047 | -0.823 | -0.677 |
| 0.804000000000003 | -1.044 | -0.821 | -0.676 |
| 0.807000000000003 | -1.041 | -0.82 | -0.675 |
| 0.810000000000003 | -1.038 | -0.818 | -0.673 |
| 0.813000000000003 | -1.035 | -0.816 | -0.672 |
| 0.816000000000003 | -1.032 | -0.814 | -0.671 |
| 0.819000000000003 | -1.029 | -0.813 | -0.67 |
| 0.822000000000003 | -1.027 | -0.811 | -0.669 |
| 0.825000000000003 | -1.024 | -0.809 | -0.668 |
| 0.828000000000003 | -1.021 | -0.808 | -0.666 |
| 0.831000000000003 | -1.018 | -0.806 | -0.665 |
| 0.834000000000003 | -1.015 | -0.804 | -0.664 |
| 0.837000000000003 | -1.013 | -0.803 | -0.663 |
| 0.840000000000003 | -1.01 | -0.801 | -0.662 |
| 0.843000000000003 | -1.007 | -0.799 | -0.661 |
| 0.846000000000003 | -1.004 | -0.798 | -0.659 |
| 0.849000000000003 | -1.002 | -0.796 | -0.658 |
| 0.852000000000003 | -0.999 | -0.795 | -0.657 |
| 0.855000000000003 | -0.996 | -0.793 | -0.656 |
| 0.858000000000003 | -0.994 | -0.791 | -0.655 |
| 0.861000000000003 | -0.991 | -0.79 | -0.654 |
| 0.864000000000003 | -0.988 | -0.788 | -0.653 |
| 0.867000000000003 | -0.986 | -0.786 | -0.652 |
| 0.870000000000003 | -0.983 | -0.785 | -0.65 |
| 0.873000000000003 | -0.981 | -0.783 | -0.649 |
| 0.876000000000003 | -0.978 | -0.782 | -0.648 |
| 0.879000000000003 | -0.975 | -0.78 | -0.647 |
| 0.882000000000003 | -0.973 | -0.779 | -0.646 |
| 0.885000000000003 | -0.97 | -0.777 | -0.645 |
| 0.888000000000003 | -0.968 | -0.776 | -0.644 |
| 0.891000000000003 | -0.965 | -0.774 | -0.643 |
| 0.894000000000003 | -0.963 | -0.772 | -0.642 |
| 0.897000000000003 | -0.96 | -0.771 | -0.641 |
| 0.900000000000003 | -0.958 | -0.769 | -0.64 |
| 0.903000000000003 | -0.955 | -0.768 | -0.639 |
| 0.906000000000003 | -0.953 | -0.766 | -0.638 |
| 0.909000000000003 | -0.95 | -0.765 | -0.636 |
| 0.912000000000003 | -0.948 | -0.763 | -0.635 |
| 0.915000000000003 | -0.946 | -0.762 | -0.634 |
| 0.918000000000003 | -0.943 | -0.76 | -0.633 |
| 0.921000000000003 | -0.941 | -0.759 | -0.632 |
| 0.924000000000003 | -0.938 | -0.757 | -0.631 |
| 0.927000000000003 | -0.936 | -0.756 | -0.63 |
| 0.930000000000003 | -0.934 | -0.754 | -0.629 |
| 0.933000000000003 | -0.931 | -0.753 | -0.628 |
| 0.936000000000003 | -0.929 | -0.752 | -0.627 |
| 0.939000000000003 | -0.927 | -0.75 | -0.626 |
| 0.942000000000003 | -0.924 | -0.749 | -0.625 |
| 0.945000000000003 | -0.922 | -0.747 | -0.624 |
| 0.948000000000003 | -0.92 | -0.746 | -0.623 |
| 0.951000000000003 | -0.917 | -0.744 | -0.622 |
| 0.954000000000003 | -0.915 | -0.743 | -0.621 |
| 0.957000000000003 | -0.913 | -0.742 | -0.62 |
| 0.960000000000003 | -0.911 | -0.74 | -0.619 |
| 0.963000000000003 | -0.908 | -0.739 | -0.618 |
| 0.966000000000003 | -0.906 | -0.737 | -0.617 |
| 0.969000000000003 | -0.904 | -0.736 | -0.616 |
| 0.972000000000003 | -0.902 | -0.735 | -0.615 |
| 0.975000000000003 | -0.899 | -0.733 | -0.614 |
| 0.978000000000003 | -0.897 | -0.732 | -0.613 |
| 0.981000000000003 | -0.895 | -0.73 | -0.612 |
| 0.984000000000003 | -0.893 | -0.729 | -0.611 |
| 0.987000000000003 | -0.891 | -0.728 | -0.61 |
| 0.990000000000003 | -0.888 | -0.726 | -0.609 |
| 0.993000000000003 | -0.886 | -0.725 | -0.608 |
| 0.996000000000003 | -0.884 | -0.724 | -0.607 |
| 0.999000000000003 | -0.882 | -0.722 | -0.606 |
| 1.002000000000003 | -0.88 | -0.721 | -0.606 |
| 1.005000000000003 | -0.878 | -0.72 | -0.605 |
| 1.008000000000003 | -0.876 | -0.718 | -0.604 |
| 1.011000000000003 | -0.874 | -0.717 | -0.603 |
| 1.014000000000003 | -0.872 | -0.716 | -0.602 |
| 1.017000000000003 | -0.87 | -0.714 | -0.601 |
| 1.020000000000003 | -0.867 | -0.713 | -0.6 |
| 1.023000000000003 | -0.865 | -0.712 | -0.599 |
| 1.026000000000002 | -0.863 | -0.71 | -0.598 |
| 1.029000000000002 | -0.861 | -0.709 | -0.597 |
| 1.032000000000002 | -0.859 | -0.708 | -0.596 |
| 1.035000000000002 | -0.857 | -0.706 | -0.595 |
| 1.038000000000002 | -0.855 | -0.705 | -0.594 |
| 1.041000000000002 | -0.853 | -0.704 | -0.593 |
| 1.044000000000002 | -0.851 | -0.703 | -0.593 |
| 1.047000000000002 | -0.849 | -0.701 | -0.592 |
| 1.050000000000002 | -0.847 | -0.7 | -0.591 |
| 1.053000000000001 | -0.845 | -0.699 | -0.59 |
| 1.056000000000001 | -0.843 | -0.698 | -0.589 |
| 1.059000000000001 | -0.841 | -0.696 | -0.588 |
| 1.062000000000001 | -0.839 | -0.695 | -0.587 |
| 1.065000000000001 | -0.838 | -0.694 | -0.586 |
| 1.068000000000001 | -0.836 | -0.693 | -0.585 |
| 1.071000000000001 | -0.834 | -0.691 | -0.585 |
| 1.074000000000001 | -0.832 | -0.69 | -0.584 |
| 1.077000000000001 | -0.83 | -0.689 | -0.583 |
| 1.08 | -0.828 | -0.688 | -0.582 |
| 1.083 | -0.826 | -0.686 | -0.581 |
| 1.086 | -0.824 | -0.685 | -0.58 |
| 1.089 | -0.822 | -0.684 | -0.579 |
| 1.092 | -0.821 | -0.683 | -0.578 |
| 1.095 | -0.819 | -0.682 | -0.578 |
| 1.098 | -0.817 | -0.68 | -0.577 |
| 1.101 | -0.815 | -0.679 | -0.576 |
| 1.104 | -0.813 | -0.678 | -0.575 |
| 1.107 | -0.811 | -0.677 | -0.574 |
| 1.109999999999999 | -0.81 | -0.676 | -0.573 |
| 1.112999999999999 | -0.808 | -0.674 | -0.572 |
| 1.115999999999999 | -0.806 | -0.673 | -0.572 |
| 1.118999999999999 | -0.804 | -0.672 | -0.571 |
| 1.121999999999999 | -0.802 | -0.671 | -0.57 |
| 1.124999999999999 | -0.801 | -0.67 | -0.569 |
| 1.127999999999999 | -0.799 | -0.669 | -0.568 |
| 1.130999999999999 | -0.797 | -0.667 | -0.567 |
| 1.133999999999999 | -0.795 | -0.666 | -0.567 |
| 1.136999999999998 | -0.794 | -0.665 | -0.566 |
| 1.139999999999998 | -0.792 | -0.664 | -0.565 |
| 1.142999999999998 | -0.79 | -0.663 | -0.564 |
| 1.145999999999998 | -0.788 | -0.662 | -0.563 |
| 1.148999999999998 | -0.787 | -0.661 | -0.563 |
| 1.151999999999998 | -0.785 | -0.659 | -0.562 |
| 1.154999999999998 | -0.783 | -0.658 | -0.561 |
| 1.157999999999998 | -0.782 | -0.657 | -0.56 |
| 1.160999999999998 | -0.78 | -0.656 | -0.559 |
| 1.163999999999997 | -0.778 | -0.655 | -0.559 |
| 1.166999999999997 | -0.776 | -0.654 | -0.558 |
| 1.169999999999997 | -0.775 | -0.653 | -0.557 |
| 1.172999999999997 | -0.773 | -0.652 | -0.556 |
| 1.175999999999997 | -0.771 | -0.651 | -0.555 |
| 1.178999999999997 | -0.77 | -0.649 | -0.555 |
| 1.181999999999997 | -0.768 | -0.648 | -0.554 |
| 1.184999999999997 | -0.767 | -0.647 | -0.553 |
| 1.187999999999997 | -0.765 | -0.646 | -0.552 |
| 1.190999999999996 | -0.763 | -0.645 | -0.551 |
| 1.193999999999996 | -0.762 | -0.644 | -0.551 |
| 1.196999999999996 | -0.76 | -0.643 | -0.55 |
| 1.199999999999996 | -0.758 | -0.642 | -0.549 |
| 1.202999999999996 | -0.757 | -0.641 | -0.548 |
| 1.205999999999996 | -0.755 | -0.64 | -0.548 |
| 1.208999999999996 | -0.754 | -0.639 | -0.547 |
| 1.211999999999996 | -0.752 | -0.638 | -0.546 |
| 1.214999999999996 | -0.751 | -0.637 | -0.545 |
| 1.217999999999996 | -0.749 | -0.636 | -0.544 |
| 1.220999999999995 | -0.747 | -0.634 | -0.544 |
| 1.223999999999995 | -0.746 | -0.633 | -0.543 |
| 1.226999999999995 | -0.744 | -0.632 | -0.542 |
| 1.229999999999995 | -0.743 | -0.631 | -0.541 |
| 1.232999999999995 | -0.741 | -0.63 | -0.541 |
| 1.235999999999995 | -0.74 | -0.629 | -0.54 |
| 1.238999999999995 | -0.738 | -0.628 | -0.539 |
| 1.241999999999995 | -0.737 | -0.627 | -0.538 |
| 1.244999999999995 | -0.735 | -0.626 | -0.538 |
| 1.247999999999994 | -0.734 | -0.625 | -0.537 |
| 1.250999999999994 | -0.732 | -0.624 | -0.536 |
| 1.253999999999994 | -0.731 | -0.623 | -0.535 |
| 1.256999999999994 | -0.729 | -0.622 | -0.535 |
| 1.259999999999994 | -0.728 | -0.621 | -0.534 |
| 1.262999999999994 | -0.726 | -0.62 | -0.533 |
| 1.265999999999994 | -0.725 | -0.619 | -0.533 |
| 1.268999999999994 | -0.723 | -0.618 | -0.532 |
| 1.271999999999994 | -0.722 | -0.617 | -0.531 |
| 1.274999999999993 | -0.72 | -0.616 | -0.53 |
| 1.277999999999993 | -0.719 | -0.615 | -0.53 |
| 1.280999999999993 | -0.717 | -0.614 | -0.529 |
| 1.283999999999993 | -0.716 | -0.613 | -0.528 |
| 1.286999999999993 | -0.715 | -0.612 | -0.528 |
| 1.289999999999993 | -0.713 | -0.611 | -0.527 |
| 1.292999999999993 | -0.712 | -0.61 | -0.526 |
| 1.295999999999993 | -0.71 | -0.609 | -0.525 |
| 1.298999999999993 | -0.709 | -0.608 | -0.525 |
| 1.301999999999992 | -0.708 | -0.607 | -0.524 |
| 1.304999999999992 | -0.706 | -0.606 | -0.523 |
| 1.307999999999992 | -0.705 | -0.605 | -0.523 |
| 1.310999999999992 | -0.703 | -0.604 | -0.522 |
| 1.313999999999992 | -0.702 | -0.603 | -0.521 |
| 1.316999999999992 | -0.701 | -0.603 | -0.52 |
| 1.319999999999992 | -0.699 | -0.602 | -0.52 |
| 1.322999999999992 | -0.698 | -0.601 | -0.519 |
| 1.325999999999992 | -0.696 | -0.6 | -0.518 |
| 1.328999999999991 | -0.695 | -0.599 | -0.518 |
| 1.331999999999991 | -0.694 | -0.598 | -0.517 |
| 1.334999999999991 | -0.692 | -0.597 | -0.516 |
| 1.337999999999991 | -0.691 | -0.596 | -0.516 |
| 1.340999999999991 | -0.69 | -0.595 | -0.515 |
| 1.343999999999991 | -0.688 | -0.594 | -0.514 |
| 1.346999999999991 | -0.687 | -0.593 | -0.514 |
| 1.349999999999991 | -0.686 | -0.592 | -0.513 |
| 1.352999999999991 | -0.684 | -0.591 | -0.512 |
| 1.35599999999999 | -0.683 | -0.59 | -0.512 |
| 1.35899999999999 | -0.682 | -0.589 | -0.511 |
| 1.36199999999999 | -0.68 | -0.589 | -0.51 |
| 1.36499999999999 | -0.679 | -0.588 | -0.51 |
| 1.36799999999999 | -0.678 | -0.587 | -0.509 |
| 1.37099999999999 | -0.677 | -0.586 | -0.508 |
| 1.37399999999999 | -0.675 | -0.585 | -0.508 |
| 1.37699999999999 | -0.674 | -0.584 | -0.507 |
| 1.37999999999999 | -0.673 | -0.583 | -0.506 |
| 1.38299999999999 | -0.671 | -0.582 | -0.506 |
| 1.385999999999989 | -0.67 | -0.581 | -0.505 |
| 1.388999999999989 | -0.669 | -0.58 | -0.504 |
| 1.391999999999989 | -0.668 | -0.58 | -0.504 |
| 1.394999999999989 | -0.666 | -0.579 | -0.503 |
| 1.397999999999989 | -0.665 | -0.578 | -0.502 |
| 1.400999999999989 | -0.664 | -0.577 | -0.502 |
| 1.403999999999989 | -0.663 | -0.576 | -0.501 |
| 1.406999999999989 | -0.661 | -0.575 | -0.5 |
| 1.409999999999989 | -0.66 | -0.574 | -0.5 |
| 1.412999999999988 | -0.659 | -0.573 | -0.499 |
| 1.415999999999988 | -0.658 | -0.573 | -0.498 |
| 1.418999999999988 | -0.657 | -0.572 | -0.498 |
| 1.421999999999988 | -0.655 | -0.571 | -0.497 |
| 1.424999999999988 | -0.654 | -0.57 | -0.497 |
| 1.427999999999988 | -0.653 | -0.569 | -0.496 |
| 1.430999999999988 | -0.652 | -0.568 | -0.495 |
| 1.433999999999988 | -0.65 | -0.567 | -0.495 |
| 1.436999999999988 | -0.649 | -0.567 | -0.494 |
| 1.439999999999987 | -0.648 | -0.566 | -0.493 |
| 1.442999999999987 | -0.647 | -0.565 | -0.493 |
| 1.445999999999987 | -0.646 | -0.564 | -0.492 |
| 1.448999999999987 | -0.645 | -0.563 | -0.492 |
| 1.451999999999987 | -0.643 | -0.562 | -0.491 |
| 1.454999999999987 | -0.642 | -0.562 | -0.49 |
| 1.457999999999987 | -0.641 | -0.561 | -0.49 |
| 1.460999999999987 | -0.64 | -0.56 | -0.489 |
| 1.463999999999987 | -0.639 | -0.559 | -0.488 |
| 1.466999999999987 | -0.638 | -0.558 | -0.488 |
| 1.469999999999986 | -0.636 | -0.557 | -0.487 |
| 1.472999999999986 | -0.635 | -0.557 | -0.487 |
| 1.475999999999986 | -0.634 | -0.556 | -0.486 |
| 1.478999999999986 | -0.633 | -0.555 | -0.485 |
| 1.481999999999986 | -0.632 | -0.554 | -0.485 |
| 1.484999999999986 | -0.631 | -0.553 | -0.484 |
| 1.487999999999986 | -0.63 | -0.553 | -0.484 |
| 1.490999999999986 | -0.628 | -0.552 | -0.483 |
| 1.493999999999986 | -0.627 | -0.551 | -0.482 |
| 1.496999999999985 | -0.626 | -0.55 | -0.482 |
| 1.499999999999985 | -0.625 | -0.549 | -0.481 |
| 1.502999999999985 | -0.624 | -0.549 | -0.481 |
| 1.505999999999985 | -0.623 | -0.548 | -0.48 |
| 1.508999999999985 | -0.622 | -0.547 | -0.479 |
| 1.511999999999985 | -0.621 | -0.546 | -0.479 |
| 1.514999999999985 | -0.62 | -0.545 | -0.478 |
| 1.517999999999985 | -0.619 | -0.545 | -0.478 |
| 1.520999999999985 | -0.617 | -0.544 | -0.477 |
| 1.523999999999984 | -0.616 | -0.543 | -0.476 |
| 1.526999999999984 | -0.615 | -0.542 | -0.476 |
| 1.529999999999984 | -0.614 | -0.541 | -0.475 |
| 1.532999999999984 | -0.613 | -0.541 | -0.475 |
| 1.535999999999984 | -0.612 | -0.54 | -0.474 |
| 1.538999999999984 | -0.611 | -0.539 | -0.474 |
| 1.541999999999984 | -0.61 | -0.538 | -0.473 |
| 1.544999999999984 | -0.609 | -0.538 | -0.472 |
| 1.547999999999984 | -0.608 | -0.537 | -0.472 |
| 1.550999999999983 | -0.607 | -0.536 | -0.471 |
| 1.553999999999983 | -0.606 | -0.535 | -0.471 |
| 1.556999999999983 | -0.605 | -0.534 | -0.47 |
| 1.559999999999983 | -0.604 | -0.534 | -0.47 |
| 1.562999999999983 | -0.603 | -0.533 | -0.469 |
| 1.565999999999983 | -0.602 | -0.532 | -0.468 |
| 1.568999999999983 | -0.601 | -0.531 | -0.468 |
| 1.571999999999983 | -0.6 | -0.531 | -0.467 |
| 1.574999999999983 | -0.599 | -0.53 | -0.467 |
| 1.577999999999983 | -0.598 | -0.529 | -0.466 |
| 1.580999999999982 | -0.597 | -0.528 | -0.466 |
| 1.583999999999982 | -0.595 | -0.528 | -0.465 |
| 1.586999999999982 | -0.594 | -0.527 | -0.464 |
| 1.589999999999982 | -0.593 | -0.526 | -0.464 |
| 1.592999999999982 | -0.592 | -0.526 | -0.463 |
| 1.595999999999982 | -0.591 | -0.525 | -0.463 |
| 1.598999999999982 | -0.59 | -0.524 | -0.462 |
| 1.601999999999982 | -0.589 | -0.523 | -0.462 |
| 1.604999999999981 | -0.588 | -0.523 | -0.461 |
| 1.607999999999981 | -0.588 | -0.522 | -0.461 |
| 1.610999999999981 | -0.587 | -0.521 | -0.46 |
| 1.613999999999981 | -0.586 | -0.52 | -0.46 |
| 1.616999999999981 | -0.585 | -0.52 | -0.459 |
| 1.619999999999981 | -0.584 | -0.519 | -0.458 |
| 1.622999999999981 | -0.583 | -0.518 | -0.458 |
| 1.625999999999981 | -0.582 | -0.518 | -0.457 |
| 1.628999999999981 | -0.581 | -0.517 | -0.457 |
| 1.63199999999998 | -0.58 | -0.516 | -0.456 |
| 1.63499999999998 | -0.579 | -0.515 | -0.456 |
| 1.63799999999998 | -0.578 | -0.515 | -0.455 |
| 1.64099999999998 | -0.577 | -0.514 | -0.455 |
| 1.64399999999998 | -0.576 | -0.513 | -0.454 |
| 1.64699999999998 | -0.575 | -0.513 | -0.454 |
| 1.64999999999998 | -0.574 | -0.512 | -0.453 |
| 1.65299999999998 | -0.573 | -0.511 | -0.453 |
| 1.65599999999998 | -0.572 | -0.51 | -0.452 |
| 1.65899999999998 | -0.571 | -0.51 | -0.451 |
| 1.661999999999979 | -0.57 | -0.509 | -0.451 |
| 1.664999999999979 | -0.569 | -0.508 | -0.45 |
| 1.667999999999979 | -0.568 | -0.508 | -0.45 |
| 1.670999999999979 | -0.567 | -0.507 | -0.449 |
| 1.673999999999979 | -0.567 | -0.506 | -0.449 |
| 1.676999999999979 | -0.566 | -0.506 | -0.448 |
| 1.679999999999979 | -0.565 | -0.505 | -0.448 |
| 1.682999999999979 | -0.564 | -0.504 | -0.447 |
| 1.685999999999979 | -0.563 | -0.504 | -0.447 |
| 1.688999999999978 | -0.562 | -0.503 | -0.446 |
| 1.691999999999978 | -0.561 | -0.502 | -0.446 |
| 1.694999999999978 | -0.56 | -0.502 | -0.445 |
| 1.697999999999978 | -0.559 | -0.501 | -0.445 |
| 1.700999999999978 | -0.558 | -0.5 | -0.444 |
| 1.703999999999978 | -0.558 | -0.5 | -0.444 |
| 1.706999999999978 | -0.557 | -0.499 | -0.443 |
| 1.709999999999978 | -0.556 | -0.498 | -0.443 |
| 1.712999999999978 | -0.555 | -0.498 | -0.442 |
| 1.715999999999977 | -0.554 | -0.497 | -0.442 |
| 1.718999999999977 | -0.553 | -0.496 | -0.441 |
| 1.721999999999977 | -0.552 | -0.496 | -0.441 |
| 1.724999999999977 | -0.551 | -0.495 | -0.44 |
| 1.727999999999977 | -0.55 | -0.494 | -0.44 |
| 1.730999999999977 | -0.55 | -0.494 | -0.439 |
| 1.733999999999977 | -0.549 | -0.493 | -0.439 |
| 1.736999999999977 | -0.548 | -0.492 | -0.438 |
| 1.739999999999977 | -0.547 | -0.492 | -0.438 |
| 1.742999999999976 | -0.546 | -0.491 | -0.437 |
| 1.745999999999976 | -0.545 | -0.49 | -0.437 |
| 1.748999999999976 | -0.544 | -0.49 | -0.436 |
| 1.751999999999976 | -0.544 | -0.489 | -0.436 |
| 1.754999999999976 | -0.543 | -0.488 | -0.435 |
| 1.757999999999976 | -0.542 | -0.488 | -0.435 |
| 1.760999999999976 | -0.541 | -0.487 | -0.434 |
| 1.763999999999976 | -0.54 | -0.486 | -0.434 |
| 1.766999999999976 | -0.539 | -0.486 | -0.433 |
| 1.769999999999976 | -0.539 | -0.485 | -0.433 |
| 1.772999999999975 | -0.538 | -0.485 | -0.432 |
| 1.775999999999975 | -0.537 | -0.484 | -0.432 |
| 1.778999999999975 | -0.536 | -0.483 | -0.431 |
| 1.781999999999975 | -0.535 | -0.483 | -0.431 |
| 1.784999999999975 | -0.534 | -0.482 | -0.43 |
| 1.787999999999975 | -0.534 | -0.481 | -0.43 |
| 1.790999999999975 | -0.533 | -0.481 | -0.429 |
| 1.793999999999975 | -0.532 | -0.48 | -0.429 |
| 1.796999999999975 | -0.531 | -0.48 | -0.428 |
| 1.799999999999974 | -0.53 | -0.479 | -0.428 |
| 1.802999999999974 | -0.53 | -0.478 | -0.427 |
| 1.805999999999974 | -0.529 | -0.478 | -0.427 |
| 1.808999999999974 | -0.528 | -0.477 | -0.427 |
| 1.811999999999974 | -0.527 | -0.476 | -0.426 |
| 1.814999999999974 | -0.526 | -0.476 | -0.426 |
| 1.817999999999974 | -0.526 | -0.475 | -0.425 |
| 1.820999999999974 | -0.525 | -0.475 | -0.425 |
| 1.823999999999974 | -0.524 | -0.474 | -0.424 |
| 1.826999999999973 | -0.523 | -0.473 | -0.424 |
| 1.829999999999973 | -0.522 | -0.473 | -0.423 |
| 1.832999999999973 | -0.522 | -0.472 | -0.423 |
| 1.835999999999973 | -0.521 | -0.472 | -0.422 |
| 1.838999999999973 | -0.52 | -0.471 | -0.422 |
| 1.841999999999973 | -0.519 | -0.47 | -0.421 |
| 1.844999999999973 | -0.518 | -0.47 | -0.421 |
| 1.847999999999973 | -0.518 | -0.469 | -0.42 |
| 1.850999999999973 | -0.517 | -0.469 | -0.42 |
| 1.853999999999973 | -0.516 | -0.468 | -0.42 |
| 1.856999999999972 | -0.515 | -0.467 | -0.419 |
| 1.859999999999972 | -0.515 | -0.467 | -0.419 |
| 1.862999999999972 | -0.514 | -0.466 | -0.418 |
| 1.865999999999972 | -0.513 | -0.466 | -0.418 |
| 1.868999999999972 | -0.512 | -0.465 | -0.417 |
| 1.871999999999972 | -0.512 | -0.464 | -0.417 |
| 1.874999999999972 | -0.511 | -0.464 | -0.416 |
| 1.877999999999972 | -0.51 | -0.463 | -0.416 |
| 1.880999999999972 | -0.509 | -0.463 | -0.415 |
| 1.883999999999971 | -0.509 | -0.462 | -0.415 |
| 1.886999999999971 | -0.508 | -0.462 | -0.415 |
| 1.889999999999971 | -0.507 | -0.461 | -0.414 |
| 1.892999999999971 | -0.506 | -0.46 | -0.414 |
| 1.895999999999971 | -0.506 | -0.46 | -0.413 |
| 1.898999999999971 | -0.505 | -0.459 | -0.413 |
| 1.901999999999971 | -0.504 | -0.459 | -0.412 |
| 1.904999999999971 | -0.503 | -0.458 | -0.412 |
| 1.907999999999971 | -0.503 | -0.458 | -0.411 |
| 1.91099999999997 | -0.502 | -0.457 | -0.411 |
| 1.91399999999997 | -0.501 | -0.456 | -0.411 |
| 1.91699999999997 | -0.5 | -0.456 | -0.41 |
| 1.91999999999997 | -0.5 | -0.455 | -0.41 |
| 1.92299999999997 | -0.499 | -0.455 | -0.409 |
| 1.92599999999997 | -0.498 | -0.454 | -0.409 |
| 1.92899999999997 | -0.498 | -0.454 | -0.408 |
| 1.93199999999997 | -0.497 | -0.453 | -0.408 |
| 1.93499999999997 | -0.496 | -0.452 | -0.407 |
| 1.937999999999969 | -0.495 | -0.452 | -0.407 |
| 1.940999999999969 | -0.495 | -0.451 | -0.407 |
| 1.943999999999969 | -0.494 | -0.451 | -0.406 |
| 1.946999999999969 | -0.493 | -0.45 | -0.406 |
| 1.949999999999969 | -0.493 | -0.45 | -0.405 |
| 1.952999999999969 | -0.492 | -0.449 | -0.405 |
| 1.955999999999969 | -0.491 | -0.449 | -0.404 |
| 1.958999999999969 | -0.491 | -0.448 | -0.404 |
| 1.961999999999969 | -0.49 | -0.448 | -0.404 |
| 1.964999999999969 | -0.489 | -0.447 | -0.403 |
| 1.967999999999968 | -0.488 | -0.446 | -0.403 |
| 1.970999999999968 | -0.488 | -0.446 | -0.402 |
| 1.973999999999968 | -0.487 | -0.445 | -0.402 |
| 1.976999999999968 | -0.486 | -0.445 | -0.401 |
| 1.979999999999968 | -0.486 | -0.444 | -0.401 |
| 1.982999999999968 | -0.485 | -0.444 | -0.401 |
| 1.985999999999968 | -0.484 | -0.443 | -0.4 |
| 1.988999999999968 | -0.484 | -0.443 | -0.4 |
| 1.991999999999968 | -0.483 | -0.442 | -0.399 |
| 1.994999999999967 | -0.482 | -0.442 | -0.399 |
| 1.997999999999967 | -0.482 | -0.441 | -0.399 |
| 2.000999999999967 | -0.481 | -0.441 | -0.398 |
| 2.003999999999968 | -0.48 | -0.44 | -0.398 |
| 2.006999999999968 | -0.48 | -0.439 | -0.397 |
| 2.009999999999968 | -0.479 | -0.439 | -0.397 |
| 2.012999999999968 | -0.478 | -0.438 | -0.396 |
| 2.015999999999968 | -0.478 | -0.438 | -0.396 |
| 2.018999999999968 | -0.477 | -0.437 | -0.396 |
| 2.021999999999968 | -0.476 | -0.437 | -0.395 |
| 2.024999999999968 | -0.476 | -0.436 | -0.395 |
| 2.027999999999968 | -0.475 | -0.436 | -0.394 |
| 2.030999999999969 | -0.474 | -0.435 | -0.394 |
| 2.033999999999969 | -0.474 | -0.435 | -0.394 |
| 2.036999999999969 | -0.473 | -0.434 | -0.393 |
| 2.039999999999969 | -0.472 | -0.434 | -0.393 |
| 2.042999999999969 | -0.472 | -0.433 | -0.392 |
| 2.045999999999969 | -0.471 | -0.433 | -0.392 |
| 2.048999999999969 | -0.47 | -0.432 | -0.392 |
| 2.051999999999969 | -0.47 | -0.432 | -0.391 |
| 2.05499999999997 | -0.469 | -0.431 | -0.391 |
| 2.05799999999997 | -0.469 | -0.431 | -0.39 |
| 2.06099999999997 | -0.468 | -0.43 | -0.39 |
| 2.06399999999997 | -0.467 | -0.43 | -0.39 |
| 2.06699999999997 | -0.467 | -0.429 | -0.389 |
| 2.06999999999997 | -0.466 | -0.429 | -0.389 |
| 2.07299999999997 | -0.465 | -0.428 | -0.388 |
| 2.07599999999997 | -0.465 | -0.428 | -0.388 |
| 2.07899999999997 | -0.464 | -0.427 | -0.388 |
| 2.081999999999971 | -0.464 | -0.427 | -0.387 |
| 2.084999999999971 | -0.463 | -0.426 | -0.387 |
| 2.087999999999971 | -0.462 | -0.426 | -0.386 |
| 2.090999999999971 | -0.462 | -0.425 | -0.386 |
| 2.093999999999971 | -0.461 | -0.425 | -0.386 |
| 2.096999999999971 | -0.46 | -0.424 | -0.385 |
| 2.099999999999971 | -0.46 | -0.424 | -0.385 |
| 2.102999999999971 | -0.459 | -0.423 | -0.384 |
| 2.105999999999971 | -0.459 | -0.423 | -0.384 |
| 2.108999999999972 | -0.458 | -0.422 | -0.384 |
| 2.111999999999972 | -0.457 | -0.422 | -0.383 |
| 2.114999999999972 | -0.457 | -0.421 | -0.383 |
| 2.117999999999972 | -0.456 | -0.421 | -0.382 |
| 2.120999999999972 | -0.456 | -0.42 | -0.382 |
| 2.123999999999972 | -0.455 | -0.42 | -0.382 |
| 2.126999999999972 | -0.454 | -0.419 | -0.381 |
| 2.129999999999972 | -0.454 | -0.419 | -0.381 |
| 2.132999999999972 | -0.453 | -0.418 | -0.381 |
| 2.135999999999973 | -0.453 | -0.418 | -0.38 |
| 2.138999999999973 | -0.452 | -0.417 | -0.38 |
| 2.141999999999973 | -0.451 | -0.417 | -0.379 |
| 2.144999999999973 | -0.451 | -0.416 | -0.379 |
| 2.147999999999973 | -0.45 | -0.416 | -0.379 |
| 2.150999999999973 | -0.45 | -0.415 | -0.378 |
| 2.153999999999973 | -0.449 | -0.415 | -0.378 |
| 2.156999999999973 | -0.448 | -0.414 | -0.378 |
| 2.159999999999973 | -0.448 | -0.414 | -0.377 |
| 2.162999999999974 | -0.447 | -0.414 | -0.377 |
| 2.165999999999974 | -0.447 | -0.413 | -0.376 |
| 2.168999999999974 | -0.446 | -0.413 | -0.376 |
| 2.171999999999974 | -0.446 | -0.412 | -0.376 |
| 2.174999999999974 | -0.445 | -0.412 | -0.375 |
| 2.177999999999974 | -0.444 | -0.411 | -0.375 |
| 2.180999999999974 | -0.444 | -0.411 | -0.375 |
| 2.183999999999974 | -0.443 | -0.41 | -0.374 |
| 2.186999999999974 | -0.443 | -0.41 | -0.374 |
| 2.189999999999975 | -0.442 | -0.409 | -0.373 |
| 2.192999999999975 | -0.442 | -0.409 | -0.373 |
| 2.195999999999975 | -0.441 | -0.408 | -0.373 |
| 2.198999999999975 | -0.44 | -0.408 | -0.372 |
| 2.201999999999975 | -0.44 | -0.407 | -0.372 |
| 2.204999999999975 | -0.439 | -0.407 | -0.372 |
| 2.207999999999975 | -0.439 | -0.407 | -0.371 |
| 2.210999999999975 | -0.438 | -0.406 | -0.371 |
| 2.213999999999976 | -0.438 | -0.406 | -0.371 |
| 2.216999999999976 | -0.437 | -0.405 | -0.37 |
| 2.219999999999976 | -0.436 | -0.405 | -0.37 |
| 2.222999999999976 | -0.436 | -0.404 | -0.369 |
| 2.225999999999976 | -0.435 | -0.404 | -0.369 |
| 2.228999999999976 | -0.435 | -0.403 | -0.369 |
| 2.231999999999976 | -0.434 | -0.403 | -0.368 |
| 2.234999999999976 | -0.434 | -0.403 | -0.368 |
| 2.237999999999976 | -0.433 | -0.402 | -0.368 |
| 2.240999999999976 | -0.433 | -0.402 | -0.367 |
| 2.243999999999976 | -0.432 | -0.401 | -0.367 |
| 2.246999999999977 | -0.432 | -0.401 | -0.367 |
| 2.249999999999977 | -0.431 | -0.4 | -0.366 |
| 2.252999999999977 | -0.43 | -0.4 | -0.366 |
| 2.255999999999977 | -0.43 | -0.399 | -0.365 |
| 2.258999999999977 | -0.429 | -0.399 | -0.365 |
| 2.261999999999977 | -0.429 | -0.399 | -0.365 |
| 2.264999999999977 | -0.428 | -0.398 | -0.364 |
| 2.267999999999977 | -0.428 | -0.398 | -0.364 |
| 2.270999999999978 | -0.427 | -0.397 | -0.364 |
| 2.273999999999978 | -0.427 | -0.397 | -0.363 |
| 2.276999999999978 | -0.426 | -0.396 | -0.363 |
| 2.279999999999978 | -0.426 | -0.396 | -0.363 |
| 2.282999999999978 | -0.425 | -0.395 | -0.362 |
| 2.285999999999978 | -0.425 | -0.395 | -0.362 |
| 2.288999999999978 | -0.424 | -0.395 | -0.362 |
| 2.291999999999978 | -0.424 | -0.394 | -0.361 |
| 2.294999999999979 | -0.423 | -0.394 | -0.361 |
| 2.297999999999979 | -0.422 | -0.393 | -0.361 |
| 2.300999999999979 | -0.422 | -0.393 | -0.36 |
| 2.303999999999979 | -0.421 | -0.392 | -0.36 |
| 2.306999999999979 | -0.421 | -0.392 | -0.36 |
| 2.309999999999979 | -0.42 | -0.392 | -0.359 |
| 2.312999999999979 | -0.42 | -0.391 | -0.359 |
| 2.315999999999979 | -0.419 | -0.391 | -0.359 |
| 2.318999999999979 | -0.419 | -0.39 | -0.358 |
| 2.32199999999998 | -0.418 | -0.39 | -0.358 |
| 2.32499999999998 | -0.418 | -0.39 | -0.358 |
| 2.32799999999998 | -0.417 | -0.389 | -0.357 |
| 2.33099999999998 | -0.417 | -0.389 | -0.357 |
| 2.33399999999998 | -0.416 | -0.388 | -0.356 |
| 2.33699999999998 | -0.416 | -0.388 | -0.356 |
| 2.33999999999998 | -0.415 | -0.387 | -0.356 |
| 2.34299999999998 | -0.415 | -0.387 | -0.355 |
| 2.34599999999998 | -0.414 | -0.387 | -0.355 |
| 2.348999999999981 | -0.414 | -0.386 | -0.355 |
| 2.351999999999981 | -0.413 | -0.386 | -0.354 |
| 2.354999999999981 | -0.413 | -0.385 | -0.354 |
| 2.357999999999981 | -0.412 | -0.385 | -0.354 |
| 2.360999999999981 | -0.412 | -0.385 | -0.353 |
| 2.363999999999981 | -0.411 | -0.384 | -0.353 |
| 2.366999999999981 | -0.411 | -0.384 | -0.353 |
| 2.369999999999981 | -0.41 | -0.383 | -0.352 |
| 2.372999999999982 | -0.41 | -0.383 | -0.352 |
| 2.375999999999982 | -0.409 | -0.382 | -0.352 |
| 2.378999999999982 | -0.409 | -0.382 | -0.351 |
| 2.381999999999982 | -0.408 | -0.382 | -0.351 |
| 2.384999999999982 | -0.408 | -0.381 | -0.351 |
| 2.387999999999982 | -0.407 | -0.381 | -0.351 |
| 2.390999999999982 | -0.407 | -0.38 | -0.35 |
| 2.393999999999982 | -0.406 | -0.38 | -0.35 |
| 2.396999999999982 | -0.406 | -0.38 | -0.35 |
| 2.399999999999983 | -0.405 | -0.379 | -0.349 |
| 2.402999999999983 | -0.405 | -0.379 | -0.349 |
| 2.405999999999983 | -0.405 | -0.378 | -0.349 |
| 2.408999999999983 | -0.404 | -0.378 | -0.348 |
| 2.411999999999983 | -0.404 | -0.378 | -0.348 |
| 2.414999999999983 | -0.403 | -0.377 | -0.348 |
| 2.417999999999983 | -0.403 | -0.377 | -0.347 |
| 2.420999999999983 | -0.402 | -0.376 | -0.347 |
| 2.423999999999983 | -0.402 | -0.376 | -0.347 |
| 2.426999999999984 | -0.401 | -0.376 | -0.346 |
| 2.429999999999984 | -0.401 | -0.375 | -0.346 |
| 2.432999999999984 | -0.4 | -0.375 | -0.346 |
| 2.435999999999984 | -0.4 | -0.374 | -0.345 |
| 2.438999999999984 | -0.399 | -0.374 | -0.345 |
| 2.441999999999984 | -0.399 | -0.374 | -0.345 |
| 2.444999999999984 | -0.398 | -0.373 | -0.344 |
| 2.447999999999984 | -0.398 | -0.373 | -0.344 |
| 2.450999999999984 | -0.397 | -0.373 | -0.344 |
| 2.453999999999985 | -0.397 | -0.372 | -0.343 |
| 2.456999999999985 | -0.397 | -0.372 | -0.343 |
| 2.459999999999985 | -0.396 | -0.371 | -0.343 |
| 2.462999999999985 | -0.396 | -0.371 | -0.342 |
| 2.465999999999985 | -0.395 | -0.371 | -0.342 |
| 2.468999999999985 | -0.395 | -0.37 | -0.342 |
| 2.471999999999985 | -0.394 | -0.37 | -0.342 |
| 2.474999999999985 | -0.394 | -0.369 | -0.341 |
| 2.477999999999986 | -0.393 | -0.369 | -0.341 |
| 2.480999999999986 | -0.393 | -0.369 | -0.341 |
| 2.483999999999986 | -0.392 | -0.368 | -0.34 |
| 2.486999999999986 | -0.392 | -0.368 | -0.34 |
| 2.489999999999986 | -0.392 | -0.368 | -0.34 |
| 2.492999999999986 | -0.391 | -0.367 | -0.339 |
| 2.495999999999986 | -0.391 | -0.367 | -0.339 |
| 2.498999999999986 | -0.39 | -0.366 | -0.339 |
| 2.501999999999986 | -0.39 | -0.366 | -0.338 |
| 2.504999999999987 | -0.389 | -0.366 | -0.338 |
| 2.507999999999987 | -0.389 | -0.365 | -0.338 |
| 2.510999999999987 | -0.388 | -0.365 | -0.338 |
| 2.513999999999987 | -0.388 | -0.365 | -0.337 |
| 2.516999999999987 | -0.388 | -0.364 | -0.337 |
| 2.519999999999987 | -0.387 | -0.364 | -0.337 |
| 2.522999999999987 | -0.387 | -0.363 | -0.336 |
| 2.525999999999987 | -0.386 | -0.363 | -0.336 |
| 2.528999999999987 | -0.386 | -0.363 | -0.336 |
| 2.531999999999988 | -0.385 | -0.362 | -0.335 |
| 2.534999999999988 | -0.385 | -0.362 | -0.335 |
| 2.537999999999988 | -0.384 | -0.362 | -0.335 |
| 2.540999999999988 | -0.384 | -0.361 | -0.335 |
| 2.543999999999988 | -0.384 | -0.361 | -0.334 |
| 2.546999999999988 | -0.383 | -0.361 | -0.334 |
| 2.549999999999988 | -0.383 | -0.36 | -0.334 |
| 2.552999999999988 | -0.382 | -0.36 | -0.333 |
| 2.555999999999988 | -0.382 | -0.359 | -0.333 |
| 2.558999999999989 | -0.381 | -0.359 | -0.333 |
| 2.561999999999989 | -0.381 | -0.359 | -0.332 |
| 2.564999999999989 | -0.381 | -0.358 | -0.332 |
| 2.567999999999989 | -0.38 | -0.358 | -0.332 |
| 2.570999999999989 | -0.38 | -0.358 | -0.332 |
| 2.573999999999989 | -0.379 | -0.357 | -0.331 |
| 2.576999999999989 | -0.379 | -0.357 | -0.331 |
| 2.579999999999989 | -0.378 | -0.357 | -0.331 |
| 2.58299999999999 | -0.378 | -0.356 | -0.33 |
| 2.58599999999999 | -0.378 | -0.356 | -0.33 |
| 2.58899999999999 | -0.377 | -0.356 | -0.33 |
| 2.59199999999999 | -0.377 | -0.355 | -0.329 |
| 2.59499999999999 | -0.376 | -0.355 | -0.329 |
| 2.59799999999999 | -0.376 | -0.354 | -0.329 |
| 2.60099999999999 | -0.376 | -0.354 | -0.329 |
| 2.60399999999999 | -0.375 | -0.354 | -0.328 |
| 2.60699999999999 | -0.375 | -0.353 | -0.328 |
| 2.60999999999999 | -0.374 | -0.353 | -0.328 |
| 2.612999999999991 | -0.374 | -0.353 | -0.327 |
| 2.615999999999991 | -0.374 | -0.352 | -0.327 |
| 2.618999999999991 | -0.373 | -0.352 | -0.327 |
| 2.621999999999991 | -0.373 | -0.352 | -0.327 |
| 2.624999999999991 | -0.372 | -0.351 | -0.326 |
| 2.627999999999991 | -0.372 | -0.351 | -0.326 |
| 2.630999999999991 | -0.371 | -0.351 | -0.326 |
| 2.633999999999991 | -0.371 | -0.35 | -0.325 |
| 2.636999999999991 | -0.371 | -0.35 | -0.325 |
| 2.639999999999992 | -0.37 | -0.35 | -0.325 |
| 2.642999999999992 | -0.37 | -0.349 | -0.325 |
| 2.645999999999992 | -0.369 | -0.349 | -0.324 |
| 2.648999999999992 | -0.369 | -0.349 | -0.324 |
| 2.651999999999992 | -0.369 | -0.348 | -0.324 |
| 2.654999999999992 | -0.368 | -0.348 | -0.323 |
| 2.657999999999992 | -0.368 | -0.348 | -0.323 |
| 2.660999999999992 | -0.367 | -0.347 | -0.323 |
| 2.663999999999992 | -0.367 | -0.347 | -0.323 |
| 2.666999999999993 | -0.367 | -0.347 | -0.322 |
| 2.669999999999993 | -0.366 | -0.346 | -0.322 |
| 2.672999999999993 | -0.366 | -0.346 | -0.322 |
| 2.675999999999993 | -0.365 | -0.346 | -0.321 |
| 2.678999999999993 | -0.365 | -0.345 | -0.321 |
| 2.681999999999993 | -0.365 | -0.345 | -0.321 |
| 2.684999999999993 | -0.364 | -0.345 | -0.321 |
| 2.687999999999993 | -0.364 | -0.344 | -0.32 |
| 2.690999999999994 | -0.364 | -0.344 | -0.32 |
| 2.693999999999994 | -0.363 | -0.344 | -0.32 |
| 2.696999999999994 | -0.363 | -0.343 | -0.32 |
| 2.699999999999994 | -0.362 | -0.343 | -0.319 |
| 2.702999999999994 | -0.362 | -0.343 | -0.319 |
| 2.705999999999994 | -0.362 | -0.342 | -0.319 |
| 2.708999999999994 | -0.361 | -0.342 | -0.318 |
| 2.711999999999994 | -0.361 | -0.342 | -0.318 |
| 2.714999999999994 | -0.36 | -0.341 | -0.318 |
| 2.717999999999995 | -0.36 | -0.341 | -0.318 |
| 2.720999999999995 | -0.36 | -0.341 | -0.317 |
| 2.723999999999995 | -0.359 | -0.34 | -0.317 |
| 2.726999999999995 | -0.359 | -0.34 | -0.317 |
| 2.729999999999995 | -0.359 | -0.34 | -0.317 |
| 2.732999999999995 | -0.358 | -0.339 | -0.316 |
| 2.735999999999995 | -0.358 | -0.339 | -0.316 |
| 2.738999999999995 | -0.357 | -0.339 | -0.316 |
| 2.741999999999995 | -0.357 | -0.338 | -0.315 |
| 2.744999999999996 | -0.357 | -0.338 | -0.315 |
| 2.747999999999996 | -0.356 | -0.338 | -0.315 |
| 2.750999999999996 | -0.356 | -0.337 | -0.315 |
| 2.753999999999996 | -0.356 | -0.337 | -0.314 |
| 2.756999999999996 | -0.355 | -0.337 | -0.314 |
| 2.759999999999996 | -0.355 | -0.336 | -0.314 |
| 2.762999999999996 | -0.354 | -0.336 | -0.314 |
| 2.765999999999996 | -0.354 | -0.336 | -0.313 |
| 2.768999999999996 | -0.354 | -0.335 | -0.313 |
| 2.771999999999997 | -0.353 | -0.335 | -0.313 |
| 2.774999999999997 | -0.353 | -0.335 | -0.313 |
| 2.777999999999997 | -0.353 | -0.334 | -0.312 |
| 2.780999999999997 | -0.352 | -0.334 | -0.312 |
| 2.783999999999997 | -0.352 | -0.334 | -0.312 |
| 2.786999999999997 | -0.352 | -0.334 | -0.311 |
| 2.789999999999997 | -0.351 | -0.333 | -0.311 |
| 2.792999999999997 | -0.351 | -0.333 | -0.311 |
| 2.795999999999998 | -0.35 | -0.333 | -0.311 |
| 2.798999999999998 | -0.35 | -0.332 | -0.31 |
| 2.801999999999998 | -0.35 | -0.332 | -0.31 |
| 2.804999999999998 | -0.349 | -0.332 | -0.31 |
| 2.807999999999998 | -0.349 | -0.331 | -0.31 |
| 2.810999999999998 | -0.349 | -0.331 | -0.309 |
| 2.813999999999998 | -0.348 | -0.331 | -0.309 |
| 2.816999999999998 | -0.348 | -0.33 | -0.309 |
| 2.819999999999998 | -0.348 | -0.33 | -0.309 |
| 2.822999999999999 | -0.347 | -0.33 | -0.308 |
| 2.825999999999999 | -0.347 | -0.329 | -0.308 |
| 2.828999999999999 | -0.347 | -0.329 | -0.308 |
| 2.831999999999999 | -0.346 | -0.329 | -0.308 |
| 2.834999999999999 | -0.346 | -0.329 | -0.307 |
| 2.837999999999999 | -0.345 | -0.328 | -0.307 |
| 2.840999999999999 | -0.345 | -0.328 | -0.307 |
| 2.843999999999999 | -0.345 | -0.328 | -0.307 |
| 2.846999999999999 | -0.344 | -0.327 | -0.306 |
| 2.85 | -0.344 | -0.327 | -0.306 |
| 2.853 | -0.344 | -0.327 | -0.306 |
| 2.856 | -0.343 | -0.326 | -0.306 |
| 2.859 | -0.343 | -0.326 | -0.305 |
| 2.862 | -0.343 | -0.326 | -0.305 |
| 2.865 | -0.342 | -0.326 | -0.305 |
| 2.868 | -0.342 | -0.325 | -0.305 |
| 2.871 | -0.342 | -0.325 | -0.304 |
| 2.874000000000001 | -0.341 | -0.325 | -0.304 |
| 2.877000000000001 | -0.341 | -0.324 | -0.304 |
| 2.880000000000001 | -0.341 | -0.324 | -0.304 |
| 2.883000000000001 | -0.34 | -0.324 | -0.303 |
| 2.886000000000001 | -0.34 | -0.323 | -0.303 |
| 2.889000000000001 | -0.34 | -0.323 | -0.303 |
| 2.892000000000001 | -0.339 | -0.323 | -0.303 |
| 2.895000000000001 | -0.339 | -0.323 | -0.302 |
| 2.898000000000001 | -0.339 | -0.322 | -0.302 |
| 2.901000000000002 | -0.338 | -0.322 | -0.302 |
| 2.904000000000002 | -0.338 | -0.322 | -0.302 |
| 2.907000000000002 | -0.338 | -0.321 | -0.301 |
| 2.910000000000002 | -0.337 | -0.321 | -0.301 |
| 2.913000000000002 | -0.337 | -0.321 | -0.301 |
| 2.916000000000002 | -0.337 | -0.321 | -0.301 |
| 2.919000000000002 | -0.336 | -0.32 | -0.3 |
| 2.922000000000002 | -0.336 | -0.32 | -0.3 |
| 2.925000000000002 | -0.336 | -0.32 | -0.3 |
| 2.928000000000003 | -0.335 | -0.319 | -0.3 |
| 2.931000000000003 | -0.335 | -0.319 | -0.299 |
| 2.934000000000003 | -0.335 | -0.319 | -0.299 |
| 2.937000000000003 | -0.334 | -0.319 | -0.299 |
| 2.940000000000003 | -0.334 | -0.318 | -0.299 |
| 2.943000000000003 | -0.334 | -0.318 | -0.298 |
| 2.946000000000003 | -0.333 | -0.318 | -0.298 |
| 2.949000000000003 | -0.333 | -0.317 | -0.298 |
| 2.952000000000003 | -0.333 | -0.317 | -0.298 |
| 2.955000000000004 | -0.332 | -0.317 | -0.297 |
| 2.958000000000004 | -0.332 | -0.317 | -0.297 |
| 2.961000000000004 | -0.332 | -0.316 | -0.297 |
| 2.964000000000004 | -0.331 | -0.316 | -0.297 |
| 2.967000000000004 | -0.331 | -0.316 | -0.296 |
| 2.970000000000004 | -0.331 | -0.315 | -0.296 |
| 2.973000000000004 | -0.33 | -0.315 | -0.296 |
| 2.976000000000004 | -0.33 | -0.315 | -0.296 |
| 2.979000000000005 | -0.33 | -0.315 | -0.295 |
| 2.982000000000005 | -0.329 | -0.314 | -0.295 |
| 2.985000000000005 | -0.329 | -0.314 | -0.295 |
| 2.988000000000005 | -0.329 | -0.314 | -0.295 |
| 2.991000000000005 | -0.328 | -0.313 | -0.294 |
| 2.994000000000005 | -0.328 | -0.313 | -0.294 |
| 2.997000000000005 | -0.328 | -0.313 | -0.294 |
| 3.000000000000005 | -0.327 | -0.313 | -0.294 |